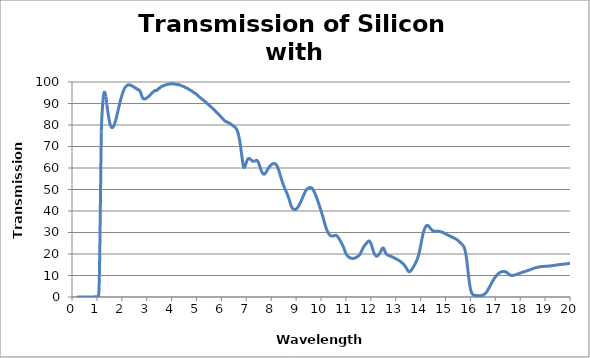
| Category | Series 0 |
|---|---|
| 0.2 | 0.002 |
| 0.201 | 0.002 |
| 0.202 | 0.002 |
| 0.203 | 0.002 |
| 0.204 | 0.002 |
| 0.205 | 0.001 |
| 0.206 | 0 |
| 0.207 | 0.002 |
| 0.208 | 0.002 |
| 0.209 | 0.004 |
| 0.21 | 0.002 |
| 0.211 | 0.001 |
| 0.212 | 0.002 |
| 0.213 | 0.001 |
| 0.214 | 0.002 |
| 0.215 | 0.003 |
| 0.216 | 0.002 |
| 0.217 | 0.002 |
| 0.218 | 0.003 |
| 0.219 | 0.005 |
| 0.22 | 0.002 |
| 0.221 | 0.003 |
| 0.222 | 0.001 |
| 0.223 | 0.003 |
| 0.224 | 0 |
| 0.225 | 0.003 |
| 0.226 | 0.002 |
| 0.227 | 0.003 |
| 0.228 | 0.001 |
| 0.229 | 0.003 |
| 0.23 | 0.002 |
| 0.231 | 0.003 |
| 0.232 | 0 |
| 0.233 | 0.002 |
| 0.234 | 0.001 |
| 0.235 | 0.001 |
| 0.236 | 0 |
| 0.237 | 0.001 |
| 0.238 | 0.005 |
| 0.239 | 0 |
| 0.24 | 0 |
| 0.241 | 0 |
| 0.242 | 0.002 |
| 0.243 | 0.004 |
| 0.244 | 0.002 |
| 0.245 | 0.001 |
| 0.246 | 0.003 |
| 0.247 | 0.003 |
| 0.248 | 0.003 |
| 0.249 | 0.003 |
| 0.25 | 0.001 |
| 0.251 | 0 |
| 0.252 | 0.001 |
| 0.253 | 0.003 |
| 0.254 | 0.002 |
| 0.255 | 0.001 |
| 0.256 | 0.004 |
| 0.257 | 0.001 |
| 0.258 | 0.001 |
| 0.259 | 0.005 |
| 0.26 | 0.002 |
| 0.261 | 0.005 |
| 0.262 | 0.001 |
| 0.263 | 0.001 |
| 0.264 | 0.002 |
| 0.265 | 0.001 |
| 0.266 | 0.004 |
| 0.267 | 0.004 |
| 0.268 | 0.005 |
| 0.269 | 0.001 |
| 0.27 | 0.003 |
| 0.271 | 0.003 |
| 0.272 | 0 |
| 0.273 | 0.002 |
| 0.274 | 0.001 |
| 0.275 | 0.001 |
| 0.276 | 0.001 |
| 0.277 | 0.001 |
| 0.278 | 0 |
| 0.279 | 0.003 |
| 0.28 | 0.003 |
| 0.281 | 0.001 |
| 0.282 | 0.002 |
| 0.283 | 0 |
| 0.284 | 0 |
| 0.285 | 0.007 |
| 0.286 | 0.005 |
| 0.287 | 0.001 |
| 0.288 | 0.004 |
| 0.289 | 0.003 |
| 0.29 | 0 |
| 0.291 | 0.003 |
| 0.292 | 0.001 |
| 0.293 | 0 |
| 0.294 | 0.001 |
| 0.295 | 0 |
| 0.296 | 0.004 |
| 0.297 | 0.002 |
| 0.298 | 0 |
| 0.299 | 0.001 |
| 0.3 | 0.003 |
| 0.301 | 0.001 |
| 0.302 | 0.001 |
| 0.303 | 0.002 |
| 0.304 | 0.002 |
| 0.305 | 0.003 |
| 0.306 | 0.003 |
| 0.307 | 0.001 |
| 0.308 | 0.002 |
| 0.309 | 0.003 |
| 0.31 | 0.001 |
| 0.311 | 0.003 |
| 0.312 | 0.001 |
| 0.313 | 0.001 |
| 0.314 | 0.001 |
| 0.315 | 0.003 |
| 0.316 | 0.003 |
| 0.317 | 0 |
| 0.318 | 0 |
| 0.319 | 0.001 |
| 0.32 | 0.002 |
| 0.321 | 0.004 |
| 0.322 | 0.001 |
| 0.323 | 0 |
| 0.324 | 0.002 |
| 0.325 | 0.002 |
| 0.326 | 0.002 |
| 0.327 | 0.005 |
| 0.328 | 0.002 |
| 0.329 | 0.004 |
| 0.33 | 0.004 |
| 0.331 | 0.002 |
| 0.332 | 0.001 |
| 0.333 | 0.003 |
| 0.334 | 0 |
| 0.335 | 0.001 |
| 0.336 | 0.001 |
| 0.337 | 0.001 |
| 0.338 | 0.001 |
| 0.339 | 0.003 |
| 0.34 | 0 |
| 0.341 | 0.002 |
| 0.342 | 0 |
| 0.343 | 0.002 |
| 0.344 | 0.002 |
| 0.345 | 0.003 |
| 0.346 | 0 |
| 0.347 | 0.006 |
| 0.348 | 0.002 |
| 0.349 | 0.002 |
| 0.35 | 0.002 |
| 0.351 | 0.001 |
| 0.352 | 0.001 |
| 0.353 | 0 |
| 0.354 | 0.001 |
| 0.355 | 0.002 |
| 0.356 | 0 |
| 0.357 | 0.003 |
| 0.358 | 0.002 |
| 0.359 | 0.002 |
| 0.36 | 0.001 |
| 0.361 | 0.002 |
| 0.362 | 0 |
| 0.363 | 0.001 |
| 0.364 | 0 |
| 0.365 | 0.001 |
| 0.366 | 0.001 |
| 0.367 | 0.001 |
| 0.368 | 0.002 |
| 0.369 | 0.001 |
| 0.37 | 0.001 |
| 0.371 | 0.002 |
| 0.372 | 0.002 |
| 0.373 | 0.002 |
| 0.374 | 0 |
| 0.375 | 0 |
| 0.376 | 0.003 |
| 0.377 | 0.004 |
| 0.378 | 0.002 |
| 0.379 | 0.005 |
| 0.38 | 0.004 |
| 0.381 | 0.001 |
| 0.382 | 0 |
| 0.383 | 0 |
| 0.384 | 0.002 |
| 0.385 | 0.001 |
| 0.386 | 0.002 |
| 0.387 | 0.002 |
| 0.388 | 0 |
| 0.389 | 0 |
| 0.39 | 0.001 |
| 0.391 | 0.002 |
| 0.392 | 0.001 |
| 0.393 | 0.002 |
| 0.394 | 0.001 |
| 0.395 | 0.001 |
| 0.396 | 0 |
| 0.397 | 0.002 |
| 0.398 | 0.001 |
| 0.399 | 0 |
| 0.4 | 0.001 |
| 0.401 | 0 |
| 0.402 | 0.002 |
| 0.403 | 0.005 |
| 0.404 | 0.004 |
| 0.405 | 0.002 |
| 0.406 | 0.002 |
| 0.407 | 0 |
| 0.408 | 0.002 |
| 0.409 | 0.001 |
| 0.41 | 0.003 |
| 0.411 | 0 |
| 0.412 | 0.002 |
| 0.413 | 0 |
| 0.414 | 0.002 |
| 0.415 | 0.005 |
| 0.416 | 0.004 |
| 0.417 | 0.001 |
| 0.418 | 0.002 |
| 0.419 | 0.003 |
| 0.42 | 0.001 |
| 0.421 | 0.001 |
| 0.422 | 0.002 |
| 0.423 | 0.003 |
| 0.424 | 0.001 |
| 0.425 | 0.001 |
| 0.426 | 0.003 |
| 0.427 | 0.003 |
| 0.428 | 0.003 |
| 0.429 | 0.001 |
| 0.43 | 0.002 |
| 0.431 | 0.001 |
| 0.432 | 0.001 |
| 0.433 | 0.002 |
| 0.434 | 0.002 |
| 0.435 | 0.001 |
| 0.436 | 0.003 |
| 0.437 | 0.002 |
| 0.438 | 0.002 |
| 0.439 | 0.003 |
| 0.44 | 0.002 |
| 0.441 | 0.001 |
| 0.442 | 0.001 |
| 0.443 | 0 |
| 0.444 | 0.003 |
| 0.445 | 0.002 |
| 0.446 | 0.002 |
| 0.447 | 0 |
| 0.448 | 0.002 |
| 0.449 | 0.001 |
| 0.45 | 0.002 |
| 0.451 | 0 |
| 0.452 | 0 |
| 0.453 | 0.002 |
| 0.454 | 0.001 |
| 0.455 | 0 |
| 0.456 | 0.001 |
| 0.457 | 0.001 |
| 0.458 | 0 |
| 0.459 | 0.001 |
| 0.46 | 0.001 |
| 0.461 | 0 |
| 0.462 | 0.001 |
| 0.463 | 0 |
| 0.464 | 0.001 |
| 0.465 | 0.002 |
| 0.466 | 0 |
| 0.467 | 0.001 |
| 0.468 | 0.003 |
| 0.469 | 0.003 |
| 0.47 | 0.002 |
| 0.471 | 0.001 |
| 0.472 | 0.001 |
| 0.473 | 0.001 |
| 0.474 | 0.002 |
| 0.475 | 0 |
| 0.476 | 0.001 |
| 0.477 | 0 |
| 0.478 | 0.001 |
| 0.479 | 0.002 |
| 0.48 | 0 |
| 0.481 | 0.002 |
| 0.482 | 0.002 |
| 0.483 | 0 |
| 0.484 | 0.001 |
| 0.485 | 0.001 |
| 0.486 | 0.003 |
| 0.487 | 0.001 |
| 0.488 | 0.001 |
| 0.489 | 0.001 |
| 0.49 | 0 |
| 0.491 | 0.001 |
| 0.492 | 0.001 |
| 0.493 | 0.001 |
| 0.494 | 0.001 |
| 0.495 | 0 |
| 0.496 | 0.001 |
| 0.497 | 0.002 |
| 0.498 | 0.003 |
| 0.499 | 0.002 |
| 0.5 | 0.001 |
| 0.501 | 0.001 |
| 0.502 | 0 |
| 0.503 | 0.001 |
| 0.504 | 0 |
| 0.505 | 0.001 |
| 0.506 | 0.004 |
| 0.507 | 0.003 |
| 0.508 | 0.003 |
| 0.509 | 0 |
| 0.51 | 0 |
| 0.511 | 0.003 |
| 0.512 | 0.003 |
| 0.513 | 0.002 |
| 0.514 | 0.003 |
| 0.515 | 0.004 |
| 0.516 | 0.002 |
| 0.517 | 0.002 |
| 0.518 | 0 |
| 0.519 | 0 |
| 0.52 | 0 |
| 0.521 | 0.001 |
| 0.522 | 0.002 |
| 0.523 | 0.003 |
| 0.524 | 0.001 |
| 0.525 | 0.001 |
| 0.526 | 0.001 |
| 0.527 | 0.003 |
| 0.528 | 0.001 |
| 0.529 | 0.001 |
| 0.53 | 0.001 |
| 0.531 | 0.002 |
| 0.532 | 0.002 |
| 0.533 | 0.002 |
| 0.534 | 0.001 |
| 0.535 | 0.002 |
| 0.536 | 0.003 |
| 0.537 | 0 |
| 0.538 | 0.001 |
| 0.539 | 0.001 |
| 0.54 | 0.001 |
| 0.541 | 0.004 |
| 0.542 | 0.001 |
| 0.543 | 0.001 |
| 0.544 | 0.001 |
| 0.545 | 0.001 |
| 0.546 | 0 |
| 0.547 | 0.001 |
| 0.548 | 0.001 |
| 0.549 | 0.003 |
| 0.55 | 0.003 |
| 0.551 | 0.001 |
| 0.552 | 0 |
| 0.553 | 0.004 |
| 0.554 | 0.001 |
| 0.555 | 0 |
| 0.556 | 0.003 |
| 0.557 | 0.002 |
| 0.558 | 0 |
| 0.559 | 0.002 |
| 0.56 | 0.003 |
| 0.561 | 0.001 |
| 0.562 | 0.001 |
| 0.563 | 0.001 |
| 0.564 | 0.002 |
| 0.565 | 0.001 |
| 0.566 | 0.002 |
| 0.567 | 0.003 |
| 0.568 | 0.001 |
| 0.569 | 0.001 |
| 0.57 | 0.001 |
| 0.571 | 0.002 |
| 0.572 | 0.003 |
| 0.573 | 0.003 |
| 0.574 | 0.003 |
| 0.575 | 0 |
| 0.576 | 0.002 |
| 0.577 | 0 |
| 0.578 | 0.005 |
| 0.579 | 0.001 |
| 0.58 | 0.002 |
| 0.581 | 0.002 |
| 0.582 | 0.002 |
| 0.583 | 0 |
| 0.584 | 0.001 |
| 0.585 | 0.002 |
| 0.586 | 0.002 |
| 0.587 | 0.002 |
| 0.588 | 0.002 |
| 0.589 | 0.001 |
| 0.59 | 0.004 |
| 0.591 | 0.001 |
| 0.592 | 0.005 |
| 0.593 | 0.001 |
| 0.594 | 0.002 |
| 0.595 | 0 |
| 0.596 | 0.005 |
| 0.597 | 0.003 |
| 0.598 | 0.004 |
| 0.599 | 0 |
| 0.6 | 0.001 |
| 0.601 | 0 |
| 0.602 | 0.003 |
| 0.603 | 0.001 |
| 0.604 | 0.004 |
| 0.605 | 0.005 |
| 0.606 | 0.001 |
| 0.607 | 0.002 |
| 0.608 | 0.005 |
| 0.609 | 0 |
| 0.61 | 0.002 |
| 0.611 | 0 |
| 0.612 | 0 |
| 0.613 | 0.001 |
| 0.614 | 0.001 |
| 0.615 | 0.001 |
| 0.616 | 0.004 |
| 0.617 | 0.001 |
| 0.618 | 0.001 |
| 0.619 | 0.002 |
| 0.62 | 0.004 |
| 0.621 | 0.001 |
| 0.622 | 0.004 |
| 0.623 | 0 |
| 0.624 | 0.004 |
| 0.625 | 0.004 |
| 0.626 | 0.001 |
| 0.627 | 0.002 |
| 0.628 | 0.004 |
| 0.629 | 0.001 |
| 0.63 | 0.002 |
| 0.631 | 0.002 |
| 0.632 | 0.003 |
| 0.633 | 0 |
| 0.634 | 0.003 |
| 0.635 | 0 |
| 0.636 | 0.001 |
| 0.637 | 0.004 |
| 0.638 | 0.001 |
| 0.639 | 0.003 |
| 0.64 | 0.001 |
| 0.641 | 0.001 |
| 0.642 | 0 |
| 0.643 | 0.008 |
| 0.644 | 0.001 |
| 0.645 | 0.003 |
| 0.646 | 0 |
| 0.647 | 0 |
| 0.648 | 0.001 |
| 0.649 | 0.001 |
| 0.65 | 0.001 |
| 0.651 | 0.002 |
| 0.652 | 0 |
| 0.653 | 0.001 |
| 0.654 | 0.004 |
| 0.655 | 0.001 |
| 0.656 | 0.001 |
| 0.657 | 0 |
| 0.658 | 0.001 |
| 0.659 | 0.003 |
| 0.66 | 0.003 |
| 0.661 | 0.001 |
| 0.662 | 0.001 |
| 0.663 | 0.002 |
| 0.664 | 0.002 |
| 0.665 | 0.001 |
| 0.666 | 0.001 |
| 0.667 | 0 |
| 0.668 | 0.003 |
| 0.669 | 0.003 |
| 0.67 | 0.002 |
| 0.671 | 0.001 |
| 0.672 | 0.001 |
| 0.673 | 0.001 |
| 0.674 | 0.001 |
| 0.675 | 0.001 |
| 0.676 | 0.002 |
| 0.677 | 0.001 |
| 0.678 | 0 |
| 0.679 | 0.003 |
| 0.68 | 0.004 |
| 0.681 | 0.002 |
| 0.682 | 0.001 |
| 0.683 | 0.001 |
| 0.684 | 0.004 |
| 0.685 | 0.002 |
| 0.686 | 0.005 |
| 0.687 | 0.003 |
| 0.688 | 0 |
| 0.689 | 0 |
| 0.69 | 0 |
| 0.691 | 0.001 |
| 0.692 | 0.001 |
| 0.693 | 0.002 |
| 0.694 | 0.002 |
| 0.695 | 0.003 |
| 0.696 | 0.001 |
| 0.697 | 0.001 |
| 0.698 | 0.001 |
| 0.699 | 0.002 |
| 0.7 | 0.001 |
| 0.701 | 0.001 |
| 0.702 | 0.001 |
| 0.703 | 0.002 |
| 0.704 | 0.001 |
| 0.705 | 0 |
| 0.706 | 0.001 |
| 0.707 | 0 |
| 0.708 | 0 |
| 0.709 | 0.002 |
| 0.71 | 0.002 |
| 0.711 | 0.002 |
| 0.712 | 0.004 |
| 0.713 | 0.003 |
| 0.714 | 0.002 |
| 0.715 | 0.002 |
| 0.716 | 0.003 |
| 0.717 | 0 |
| 0.718 | 0 |
| 0.719 | 0.001 |
| 0.72 | 0.003 |
| 0.721 | 0.001 |
| 0.722 | 0.002 |
| 0.723 | 0.001 |
| 0.724 | 0.003 |
| 0.725 | 0.001 |
| 0.726 | 0.001 |
| 0.727 | 0.004 |
| 0.728 | 0.002 |
| 0.729 | 0.001 |
| 0.73 | 0.002 |
| 0.731 | 0.001 |
| 0.732 | 0 |
| 0.733 | 0 |
| 0.734 | 0.002 |
| 0.735 | 0.002 |
| 0.736 | 0.002 |
| 0.737 | 0.001 |
| 0.738 | 0 |
| 0.739 | 0 |
| 0.74 | 0.002 |
| 0.741 | 0 |
| 0.742 | 0 |
| 0.743 | 0.002 |
| 0.744 | 0.005 |
| 0.745 | 0.002 |
| 0.746 | 0.002 |
| 0.747 | 0 |
| 0.748 | 0 |
| 0.749 | 0.003 |
| 0.75 | 0.001 |
| 0.751 | 0.001 |
| 0.752 | 0 |
| 0.753 | 0.002 |
| 0.754 | 0.002 |
| 0.755 | 0.001 |
| 0.756 | 0.002 |
| 0.757 | 0.001 |
| 0.758 | 0.001 |
| 0.759 | 0.004 |
| 0.76 | 0.002 |
| 0.761 | 0.001 |
| 0.762 | 0 |
| 0.763 | 0 |
| 0.764 | 0.001 |
| 0.765 | 0.002 |
| 0.766 | 0.002 |
| 0.767 | 0.003 |
| 0.768 | 0 |
| 0.769 | 0 |
| 0.77 | 0.001 |
| 0.771 | 0.003 |
| 0.772 | 0 |
| 0.773 | 0 |
| 0.774 | 0.001 |
| 0.775 | 0.002 |
| 0.776 | 0.001 |
| 0.777 | 0.001 |
| 0.778 | 0.001 |
| 0.779 | 0.003 |
| 0.78 | 0.001 |
| 0.781 | 0.001 |
| 0.782 | 0.001 |
| 0.783 | 0.001 |
| 0.784 | 0 |
| 0.785 | 0.001 |
| 0.786 | 0.002 |
| 0.787 | 0.002 |
| 0.788 | 0.003 |
| 0.789 | 0.004 |
| 0.79 | 0.002 |
| 0.791 | 0.001 |
| 0.792 | 0.001 |
| 0.793 | 0.002 |
| 0.794 | 0.001 |
| 0.795 | 0.001 |
| 0.796 | 0.004 |
| 0.797 | 0.004 |
| 0.798 | 0.002 |
| 0.799 | 0.002 |
| 0.8 | 0.003 |
| 0.801 | 0.002 |
| 0.802 | 0.002 |
| 0.803 | 0.003 |
| 0.804 | 0.002 |
| 0.805 | 0.002 |
| 0.806 | 0.002 |
| 0.807 | 0 |
| 0.808 | 0.001 |
| 0.809 | 0 |
| 0.81 | 0 |
| 0.811 | 0 |
| 0.812 | 0.002 |
| 0.813 | 0.003 |
| 0.814 | 0.002 |
| 0.815 | 0.001 |
| 0.816 | 0 |
| 0.817 | 0 |
| 0.818 | 0.001 |
| 0.819 | 0.002 |
| 0.82 | 0.003 |
| 0.821 | 0.002 |
| 0.822 | 0.001 |
| 0.823 | 0.003 |
| 0.824 | 0.003 |
| 0.825 | 0 |
| 0.826 | 0.002 |
| 0.827 | 0.003 |
| 0.828 | 0.001 |
| 0.829 | 0.001 |
| 0.83 | 0 |
| 0.831 | 0.003 |
| 0.832 | 0.002 |
| 0.833 | 0.003 |
| 0.834 | 0.003 |
| 0.835 | 0.001 |
| 0.836 | 0.001 |
| 0.837 | 0.001 |
| 0.838 | 0.001 |
| 0.839 | 0 |
| 0.84 | 0.001 |
| 0.841 | 0.001 |
| 0.842 | 0.001 |
| 0.843 | 0.001 |
| 0.844 | 0.002 |
| 0.845 | 0.002 |
| 0.846 | 0.003 |
| 0.847 | 0.001 |
| 0.848 | 0 |
| 0.849 | 0.001 |
| 0.85 | 0.002 |
| 0.851 | 0.001 |
| 0.852 | 0 |
| 0.853 | 0.003 |
| 0.854 | 0.003 |
| 0.855 | 0.004 |
| 0.856 | 0.002 |
| 0.857 | 0.001 |
| 0.858 | 0.001 |
| 0.859 | 0.001 |
| 0.86 | 0.005 |
| 0.861 | 0.006 |
| 0.862 | 0.003 |
| 0.863 | 0.002 |
| 0.864 | 0.005 |
| 0.865 | 0.015 |
| 0.866 | 0.003 |
| 0.867 | 0.001 |
| 0.868 | 0.012 |
| 0.869 | 0 |
| 0.87 | 0.024 |
| 0.871 | 0.014 |
| 0.872 | 0.005 |
| 0.873 | 0.022 |
| 0.874 | 0.022 |
| 0.875 | 0.001 |
| 0.876 | 0.018 |
| 0.877 | 0.037 |
| 0.878 | 0.021 |
| 0.879 | 0.015 |
| 0.88 | 0.023 |
| 0.881 | 0.027 |
| 0.882 | 0.018 |
| 0.883 | 0.012 |
| 0.884 | 0.001 |
| 0.885 | 0.013 |
| 0.886 | 0.023 |
| 0.887 | 0.008 |
| 0.888 | 0.034 |
| 0.889 | 0.022 |
| 0.89 | 0.03 |
| 0.891 | 0.035 |
| 0.892 | 0.031 |
| 0.893 | 0.007 |
| 0.894 | 0.009 |
| 0.895 | 0.002 |
| 0.896 | 0.02 |
| 0.897 | 0.003 |
| 0.898 | 0.054 |
| 0.899 | 0.051 |
| 0.9 | 0.01 |
| 0.901 | 0.017 |
| 0.902 | 0.018 |
| 0.903 | 0.017 |
| 0.904 | 0.045 |
| 0.905 | 0.047 |
| 0.906 | 0.018 |
| 0.907 | 0.044 |
| 0.908 | 0.013 |
| 0.909 | 0.005 |
| 0.91 | 0.022 |
| 0.911 | 0.03 |
| 0.912 | 0.022 |
| 0.913 | 0.022 |
| 0.914 | 0.019 |
| 0.915 | 0.014 |
| 0.916 | 0.035 |
| 0.917 | 0.01 |
| 0.918 | 0.035 |
| 0.919 | 0.033 |
| 0.92 | 0.022 |
| 0.921 | 0.01 |
| 0.922 | 0.056 |
| 0.923 | 0.024 |
| 0.924 | 0.04 |
| 0.925 | 0.028 |
| 0.926 | 0.003 |
| 0.927 | 0.009 |
| 0.928 | 0.036 |
| 0.929 | 0.031 |
| 0.93 | 0.037 |
| 0.931 | 0.034 |
| 0.932 | 0.029 |
| 0.933 | 0.03 |
| 0.934 | 0.025 |
| 0.935 | 0.011 |
| 0.936 | 0.012 |
| 0.937 | 0.039 |
| 0.938 | 0.011 |
| 0.939 | 0.05 |
| 0.94 | 0.022 |
| 0.941 | 0.055 |
| 0.942 | 0.04 |
| 0.943 | 0.021 |
| 0.944 | 0.02 |
| 0.945 | 0.005 |
| 0.946 | 0.067 |
| 0.947 | 0.06 |
| 0.948 | 0.032 |
| 0.949 | 0.04 |
| 0.95 | 0.027 |
| 0.951 | 0.028 |
| 0.952 | 0.022 |
| 0.953 | 0.02 |
| 0.954 | 0.012 |
| 0.955 | 0.034 |
| 0.956 | 0.025 |
| 0.957 | 0.007 |
| 0.958 | 0.031 |
| 0.959 | 0.028 |
| 0.96 | 0.01 |
| 0.961 | 0.035 |
| 0.962 | 0.001 |
| 0.963 | 0.01 |
| 0.964 | 0.013 |
| 0.965 | 0.028 |
| 0.966 | 0.014 |
| 0.967 | 0.027 |
| 0.968 | 0.006 |
| 0.969 | 0.016 |
| 0.97 | 0.014 |
| 0.971 | 0.029 |
| 0.972 | 0.033 |
| 0.973 | 0.056 |
| 0.974 | 0.045 |
| 0.975 | 0.008 |
| 0.976 | 0.013 |
| 0.977 | 0.052 |
| 0.978 | 0.04 |
| 0.979 | 0.044 |
| 0.98 | 0.045 |
| 0.981 | 0.025 |
| 0.982 | 0.029 |
| 0.983 | 0.024 |
| 0.984 | 0.032 |
| 0.985 | 0.029 |
| 0.986 | 0.061 |
| 0.987 | 0.029 |
| 0.988 | 0.036 |
| 0.989 | 0.005 |
| 0.99 | 0.051 |
| 0.991 | 0.031 |
| 0.992 | 0.031 |
| 0.993 | 0.04 |
| 0.994 | 0.03 |
| 0.995 | 0.054 |
| 0.996 | 0.033 |
| 0.997 | 0.029 |
| 0.998 | 0.024 |
| 0.999 | 0.017 |
| 1.0 | 0.053 |
| 1.001 | 0.026 |
| 1.002 | 0.027 |
| 1.003 | 0.035 |
| 1.004 | 0.033 |
| 1.005 | 0.002 |
| 1.006 | 0.045 |
| 1.007 | 0.008 |
| 1.008 | 0.017 |
| 1.009 | 0.014 |
| 1.01 | 0.016 |
| 1.011 | 0.03 |
| 1.012 | 0.039 |
| 1.013 | 0.048 |
| 1.014 | 0.036 |
| 1.015 | 0.042 |
| 1.016 | 0.023 |
| 1.017 | 0.051 |
| 1.018 | 0.038 |
| 1.019 | 0.021 |
| 1.02 | 0.039 |
| 1.021 | 0.032 |
| 1.022 | 0.036 |
| 1.023 | 0.012 |
| 1.024 | 0.059 |
| 1.025 | 0.048 |
| 1.026 | 0.004 |
| 1.027 | 0.026 |
| 1.028 | 0.02 |
| 1.029 | 0.021 |
| 1.03 | 0.04 |
| 1.031 | 0.019 |
| 1.032 | 0.021 |
| 1.033 | 0.022 |
| 1.034 | 0.054 |
| 1.035 | 0.004 |
| 1.036 | 0.052 |
| 1.037 | 0.023 |
| 1.038 | 0.028 |
| 1.039 | 0 |
| 1.04 | 0.004 |
| 1.041 | 0.031 |
| 1.042 | 0.019 |
| 1.043 | 0.033 |
| 1.044 | 0.036 |
| 1.045 | 0.002 |
| 1.046 | 0.033 |
| 1.047 | 0.019 |
| 1.048 | 0.039 |
| 1.049 | 0.015 |
| 1.05 | 0.019 |
| 1.051 | 0.023 |
| 1.052 | 0.004 |
| 1.053 | 0.064 |
| 1.054 | 0.094 |
| 1.055 | 0.108 |
| 1.056 | 0.142 |
| 1.057 | 0.131 |
| 1.058 | 0.105 |
| 1.059 | 0.123 |
| 1.06 | 0.179 |
| 1.061 | 0.241 |
| 1.062 | 0.355 |
| 1.063 | 0.427 |
| 1.064 | 0.514 |
| 1.065 | 0.592 |
| 1.066 | 0.663 |
| 1.067 | 0.729 |
| 1.068 | 0.823 |
| 1.069 | 0.922 |
| 1.07 | 0.967 |
| 1.071 | 1.063 |
| 1.072 | 1.188 |
| 1.073 | 1.375 |
| 1.074 | 1.569 |
| 1.075 | 1.753 |
| 1.076 | 1.94 |
| 1.077 | 2.128 |
| 1.078 | 2.303 |
| 1.079 | 2.479 |
| 1.08 | 2.707 |
| 1.081 | 2.972 |
| 1.082 | 3.233 |
| 1.083 | 3.588 |
| 1.084 | 3.887 |
| 1.085 | 4.192 |
| 1.086 | 4.484 |
| 1.087 | 4.767 |
| 1.088 | 5.107 |
| 1.089 | 5.509 |
| 1.09 | 5.938 |
| 1.091 | 6.347 |
| 1.092 | 6.756 |
| 1.093 | 7.188 |
| 1.094 | 7.616 |
| 1.095 | 8.036 |
| 1.096 | 8.522 |
| 1.097 | 9.024 |
| 1.098 | 9.594 |
| 1.099 | 10.143 |
| 1.1 | 10.691 |
| 1.101 | 11.256 |
| 1.102 | 11.814 |
| 1.103 | 12.396 |
| 1.104 | 12.964 |
| 1.105 | 13.533 |
| 1.106 | 14.141 |
| 1.107 | 14.814 |
| 1.108 | 15.528 |
| 1.109 | 16.215 |
| 1.11 | 16.919 |
| 1.111 | 17.659 |
| 1.112 | 18.413 |
| 1.113 | 19.185 |
| 1.114 | 19.954 |
| 1.115 | 20.75 |
| 1.116 | 21.577 |
| 1.117 | 22.361 |
| 1.118 | 23.158 |
| 1.119 | 23.998 |
| 1.12 | 24.852 |
| 1.121 | 25.694 |
| 1.122 | 26.565 |
| 1.123 | 27.492 |
| 1.124 | 28.371 |
| 1.125 | 29.245 |
| 1.126 | 30.118 |
| 1.127 | 31.023 |
| 1.128 | 31.945 |
| 1.129 | 32.861 |
| 1.13 | 33.777 |
| 1.131 | 34.708 |
| 1.132 | 35.63 |
| 1.133 | 36.557 |
| 1.134 | 37.473 |
| 1.135 | 38.47 |
| 1.136 | 39.487 |
| 1.137 | 40.426 |
| 1.138 | 41.357 |
| 1.139 | 42.286 |
| 1.14 | 43.206 |
| 1.141 | 44.154 |
| 1.142 | 45.086 |
| 1.143 | 46.031 |
| 1.144 | 46.979 |
| 1.145 | 47.907 |
| 1.146 | 48.834 |
| 1.147 | 49.808 |
| 1.148 | 50.757 |
| 1.149 | 51.691 |
| 1.15 | 52.702 |
| 1.151 | 53.727 |
| 1.152 | 54.712 |
| 1.153 | 55.699 |
| 1.154 | 56.656 |
| 1.155 | 57.613 |
| 1.156 | 58.577 |
| 1.157 | 59.521 |
| 1.158 | 60.478 |
| 1.159 | 61.403 |
| 1.16 | 62.29 |
| 1.161 | 63.186 |
| 1.162 | 64.064 |
| 1.163 | 64.946 |
| 1.164 | 65.814 |
| 1.165 | 66.659 |
| 1.166 | 67.454 |
| 1.167 | 68.23 |
| 1.168 | 68.994 |
| 1.169 | 69.764 |
| 1.17 | 70.522 |
| 1.171 | 71.302 |
| 1.172 | 72.117 |
| 1.173 | 72.966 |
| 1.174 | 73.805 |
| 1.175 | 74.669 |
| 1.176 | 75.546 |
| 1.177 | 76.38 |
| 1.178 | 77.115 |
| 1.179 | 77.71 |
| 1.18 | 78.175 |
| 1.181 | 78.587 |
| 1.182 | 78.93 |
| 1.183 | 79.258 |
| 1.184 | 79.581 |
| 1.185 | 79.862 |
| 1.186 | 80.125 |
| 1.187 | 80.39 |
| 1.188 | 80.642 |
| 1.189 | 80.899 |
| 1.19 | 81.178 |
| 1.191 | 81.443 |
| 1.192 | 81.71 |
| 1.193 | 81.972 |
| 1.194 | 82.207 |
| 1.195 | 82.439 |
| 1.196 | 82.675 |
| 1.197 | 82.9 |
| 1.198 | 83.138 |
| 1.199 | 83.375 |
| 1.2 | 83.592 |
| 1.201 | 83.801 |
| 1.202 | 84.025 |
| 1.203 | 84.27 |
| 1.204 | 84.487 |
| 1.205 | 84.685 |
| 1.206 | 84.889 |
| 1.207 | 85.102 |
| 1.208 | 85.309 |
| 1.209 | 85.52 |
| 1.21 | 85.724 |
| 1.211 | 85.917 |
| 1.212 | 86.11 |
| 1.213 | 86.305 |
| 1.214 | 86.456 |
| 1.215 | 86.612 |
| 1.216 | 86.816 |
| 1.217 | 87.027 |
| 1.218 | 87.242 |
| 1.219 | 87.42 |
| 1.22 | 87.582 |
| 1.221 | 87.739 |
| 1.222 | 87.919 |
| 1.223 | 88.125 |
| 1.224 | 88.3 |
| 1.225 | 88.461 |
| 1.226 | 88.628 |
| 1.227 | 88.778 |
| 1.228 | 88.946 |
| 1.229 | 89.112 |
| 1.23 | 89.29 |
| 1.231 | 89.456 |
| 1.232 | 89.601 |
| 1.233 | 89.777 |
| 1.234 | 89.952 |
| 1.235 | 90.107 |
| 1.236 | 90.256 |
| 1.237 | 90.4 |
| 1.238 | 90.541 |
| 1.239 | 90.678 |
| 1.24 | 90.818 |
| 1.241 | 90.966 |
| 1.242 | 91.12 |
| 1.243 | 91.25 |
| 1.244 | 91.386 |
| 1.245 | 91.513 |
| 1.246 | 91.653 |
| 1.247 | 91.787 |
| 1.248 | 91.915 |
| 1.249 | 92.038 |
| 1.25 | 92.166 |
| 1.251 | 92.256 |
| 1.252 | 92.357 |
| 1.253 | 92.465 |
| 1.254 | 92.584 |
| 1.255 | 92.694 |
| 1.256 | 92.781 |
| 1.257 | 92.878 |
| 1.258 | 92.991 |
| 1.259 | 93.086 |
| 1.26 | 93.171 |
| 1.261 | 93.274 |
| 1.262 | 93.386 |
| 1.263 | 93.482 |
| 1.264 | 93.549 |
| 1.265 | 93.64 |
| 1.266 | 93.731 |
| 1.267 | 93.806 |
| 1.268 | 93.891 |
| 1.269 | 93.963 |
| 1.27 | 94.019 |
| 1.271 | 94.1 |
| 1.272 | 94.174 |
| 1.273 | 94.253 |
| 1.274 | 94.333 |
| 1.275 | 94.379 |
| 1.276 | 94.444 |
| 1.277 | 94.509 |
| 1.278 | 94.583 |
| 1.279 | 94.637 |
| 1.28 | 94.68 |
| 1.281 | 94.742 |
| 1.282 | 94.781 |
| 1.283 | 94.809 |
| 1.284 | 94.856 |
| 1.285 | 94.935 |
| 1.286 | 94.97 |
| 1.287 | 94.984 |
| 1.288 | 95.013 |
| 1.289 | 95.04 |
| 1.29 | 95.057 |
| 1.291 | 95.087 |
| 1.292 | 95.126 |
| 1.293 | 95.151 |
| 1.294 | 95.188 |
| 1.295 | 95.183 |
| 1.296 | 95.181 |
| 1.297 | 95.209 |
| 1.298 | 95.256 |
| 1.299 | 95.238 |
| 1.3 | 95.235 |
| 1.301 | 95.235 |
| 1.302 | 95.273 |
| 1.303 | 95.283 |
| 1.304 | 95.293 |
| 1.305 | 95.295 |
| 1.306 | 95.292 |
| 1.307 | 95.296 |
| 1.308 | 95.289 |
| 1.309 | 95.252 |
| 1.31 | 95.242 |
| 1.311 | 95.252 |
| 1.312 | 95.224 |
| 1.313 | 95.218 |
| 1.314 | 95.232 |
| 1.315 | 95.227 |
| 1.316 | 95.194 |
| 1.317 | 95.188 |
| 1.318 | 95.157 |
| 1.319 | 95.116 |
| 1.32 | 95.082 |
| 1.321 | 95.066 |
| 1.322 | 95.031 |
| 1.323 | 94.987 |
| 1.324 | 94.966 |
| 1.325 | 94.929 |
| 1.326 | 94.906 |
| 1.327 | 94.859 |
| 1.328 | 94.85 |
| 1.329 | 94.796 |
| 1.33 | 94.781 |
| 1.331 | 94.741 |
| 1.332 | 94.678 |
| 1.333 | 94.613 |
| 1.334 | 94.588 |
| 1.335 | 94.546 |
| 1.336 | 94.502 |
| 1.337 | 94.436 |
| 1.338 | 94.402 |
| 1.339 | 94.362 |
| 1.34 | 94.319 |
| 1.341 | 94.217 |
| 1.342 | 94.179 |
| 1.343 | 94.121 |
| 1.344 | 94.075 |
| 1.345 | 94.002 |
| 1.346 | 93.929 |
| 1.347 | 93.911 |
| 1.348 | 93.835 |
| 1.349 | 93.765 |
| 1.35 | 93.722 |
| 1.351 | 93.648 |
| 1.352 | 93.54 |
| 1.353 | 93.487 |
| 1.354 | 93.437 |
| 1.355 | 93.372 |
| 1.356 | 93.227 |
| 1.357 | 93.259 |
| 1.358 | 93.175 |
| 1.359 | 93.085 |
| 1.36 | 93.028 |
| 1.361 | 92.906 |
| 1.362 | 92.824 |
| 1.363 | 92.72 |
| 1.364 | 92.689 |
| 1.365 | 92.626 |
| 1.366 | 92.539 |
| 1.367 | 92.46 |
| 1.368 | 92.389 |
| 1.369 | 92.323 |
| 1.37 | 92.228 |
| 1.371 | 92.115 |
| 1.372 | 92.077 |
| 1.373 | 91.996 |
| 1.374 | 91.883 |
| 1.375 | 91.82 |
| 1.376 | 91.684 |
| 1.377 | 91.6 |
| 1.378 | 91.565 |
| 1.379 | 91.514 |
| 1.38 | 91.411 |
| 1.381 | 91.367 |
| 1.382 | 91.22 |
| 1.383 | 91.186 |
| 1.384 | 91.065 |
| 1.385 | 90.997 |
| 1.386 | 90.897 |
| 1.387 | 90.804 |
| 1.388 | 90.696 |
| 1.389 | 90.606 |
| 1.39 | 90.519 |
| 1.391 | 90.438 |
| 1.392 | 90.362 |
| 1.393 | 90.258 |
| 1.394 | 90.173 |
| 1.395 | 90.093 |
| 1.396 | 90 |
| 1.397 | 89.911 |
| 1.398 | 89.806 |
| 1.399 | 89.8 |
| 1.4 | 89.627 |
| 1.401 | 89.529 |
| 1.402 | 89.428 |
| 1.403 | 89.347 |
| 1.404 | 89.241 |
| 1.405 | 89.176 |
| 1.406 | 89.062 |
| 1.407 | 89.001 |
| 1.408 | 88.921 |
| 1.409 | 88.834 |
| 1.41 | 88.762 |
| 1.411 | 88.647 |
| 1.412 | 88.545 |
| 1.413 | 88.452 |
| 1.414 | 88.373 |
| 1.415 | 88.283 |
| 1.416 | 88.193 |
| 1.417 | 88.111 |
| 1.418 | 88.02 |
| 1.419 | 87.954 |
| 1.42 | 87.855 |
| 1.421 | 87.77 |
| 1.422 | 87.691 |
| 1.423 | 87.587 |
| 1.424 | 87.493 |
| 1.425 | 87.399 |
| 1.426 | 87.32 |
| 1.427 | 87.245 |
| 1.428 | 87.136 |
| 1.429 | 87.091 |
| 1.43 | 86.97 |
| 1.431 | 86.89 |
| 1.432 | 86.801 |
| 1.433 | 86.706 |
| 1.434 | 86.636 |
| 1.435 | 86.531 |
| 1.436 | 86.436 |
| 1.437 | 86.366 |
| 1.438 | 86.288 |
| 1.439 | 86.197 |
| 1.44 | 86.124 |
| 1.441 | 86.018 |
| 1.442 | 85.933 |
| 1.443 | 85.839 |
| 1.444 | 85.742 |
| 1.445 | 85.684 |
| 1.446 | 85.59 |
| 1.447 | 85.514 |
| 1.448 | 85.429 |
| 1.449 | 85.337 |
| 1.45 | 85.239 |
| 1.451 | 85.195 |
| 1.452 | 85.119 |
| 1.453 | 85.045 |
| 1.454 | 84.984 |
| 1.455 | 84.895 |
| 1.456 | 84.79 |
| 1.457 | 84.691 |
| 1.458 | 84.607 |
| 1.459 | 84.581 |
| 1.46 | 84.512 |
| 1.461 | 84.447 |
| 1.462 | 84.394 |
| 1.463 | 84.318 |
| 1.464 | 84.226 |
| 1.465 | 84.095 |
| 1.466 | 84.041 |
| 1.467 | 83.989 |
| 1.468 | 83.902 |
| 1.469 | 83.845 |
| 1.47 | 83.769 |
| 1.471 | 83.689 |
| 1.472 | 83.61 |
| 1.473 | 83.545 |
| 1.474 | 83.492 |
| 1.475 | 83.395 |
| 1.476 | 83.328 |
| 1.477 | 83.273 |
| 1.478 | 83.23 |
| 1.479 | 83.168 |
| 1.48 | 83.085 |
| 1.481 | 83.018 |
| 1.482 | 82.963 |
| 1.483 | 82.903 |
| 1.484 | 82.823 |
| 1.485 | 82.759 |
| 1.486 | 82.659 |
| 1.487 | 82.588 |
| 1.488 | 82.527 |
| 1.489 | 82.444 |
| 1.49 | 82.424 |
| 1.491 | 82.36 |
| 1.492 | 82.301 |
| 1.493 | 82.248 |
| 1.494 | 82.183 |
| 1.495 | 82.14 |
| 1.496 | 82.114 |
| 1.497 | 82.052 |
| 1.498 | 81.983 |
| 1.499 | 81.872 |
| 1.5 | 81.798 |
| 1.501 | 81.782 |
| 1.502 | 81.738 |
| 1.503 | 81.694 |
| 1.504 | 81.638 |
| 1.505 | 81.588 |
| 1.506 | 81.531 |
| 1.507 | 81.466 |
| 1.508 | 81.407 |
| 1.509 | 81.378 |
| 1.51 | 81.333 |
| 1.511 | 81.284 |
| 1.512 | 81.224 |
| 1.513 | 81.163 |
| 1.514 | 81.088 |
| 1.515 | 81.054 |
| 1.516 | 81.018 |
| 1.517 | 80.987 |
| 1.518 | 80.946 |
| 1.519 | 80.89 |
| 1.52 | 80.815 |
| 1.521 | 80.746 |
| 1.522 | 80.696 |
| 1.523 | 80.67 |
| 1.524 | 80.645 |
| 1.525 | 80.603 |
| 1.526 | 80.555 |
| 1.527 | 80.529 |
| 1.528 | 80.485 |
| 1.529 | 80.443 |
| 1.53 | 80.395 |
| 1.531 | 80.347 |
| 1.532 | 80.308 |
| 1.533 | 80.252 |
| 1.534 | 80.231 |
| 1.535 | 80.2 |
| 1.536 | 80.165 |
| 1.537 | 80.133 |
| 1.538 | 80.106 |
| 1.539 | 80.08 |
| 1.54 | 80.036 |
| 1.541 | 79.967 |
| 1.542 | 79.897 |
| 1.543 | 79.867 |
| 1.544 | 79.862 |
| 1.545 | 79.846 |
| 1.546 | 79.833 |
| 1.547 | 79.798 |
| 1.548 | 79.773 |
| 1.549 | 79.733 |
| 1.55 | 79.696 |
| 1.551 | 79.665 |
| 1.552 | 79.638 |
| 1.553 | 79.624 |
| 1.554 | 79.605 |
| 1.555 | 79.571 |
| 1.556 | 79.538 |
| 1.557 | 79.526 |
| 1.558 | 79.476 |
| 1.559 | 79.448 |
| 1.56 | 79.451 |
| 1.561 | 79.425 |
| 1.562 | 79.396 |
| 1.563 | 79.368 |
| 1.564 | 79.351 |
| 1.565 | 79.297 |
| 1.566 | 79.261 |
| 1.567 | 79.274 |
| 1.568 | 79.249 |
| 1.569 | 79.238 |
| 1.57 | 79.236 |
| 1.571 | 79.183 |
| 1.572 | 79.132 |
| 1.573 | 79.108 |
| 1.574 | 79.124 |
| 1.575 | 79.127 |
| 1.576 | 79.099 |
| 1.577 | 79.081 |
| 1.578 | 79.061 |
| 1.579 | 79.026 |
| 1.58 | 79.006 |
| 1.581 | 79.009 |
| 1.582 | 79.003 |
| 1.583 | 78.991 |
| 1.584 | 78.979 |
| 1.585 | 78.968 |
| 1.586 | 78.949 |
| 1.587 | 78.955 |
| 1.588 | 78.955 |
| 1.589 | 78.92 |
| 1.59 | 78.896 |
| 1.591 | 78.899 |
| 1.592 | 78.891 |
| 1.593 | 78.86 |
| 1.594 | 78.852 |
| 1.595 | 78.876 |
| 1.596 | 78.877 |
| 1.597 | 78.864 |
| 1.598 | 78.849 |
| 1.599 | 78.848 |
| 1.6 | 78.829 |
| 1.601 | 78.83 |
| 1.602 | 78.833 |
| 1.603 | 78.804 |
| 1.604 | 78.793 |
| 1.605 | 78.815 |
| 1.606 | 78.821 |
| 1.607 | 78.812 |
| 1.608 | 78.814 |
| 1.609 | 78.812 |
| 1.61 | 78.818 |
| 1.611 | 78.817 |
| 1.612 | 78.798 |
| 1.613 | 78.791 |
| 1.614 | 78.785 |
| 1.615 | 78.788 |
| 1.616 | 78.785 |
| 1.617 | 78.796 |
| 1.618 | 78.787 |
| 1.619 | 78.796 |
| 1.62 | 78.791 |
| 1.621 | 78.789 |
| 1.622 | 78.812 |
| 1.623 | 78.833 |
| 1.624 | 78.849 |
| 1.625 | 78.864 |
| 1.626 | 78.865 |
| 1.627 | 78.849 |
| 1.628 | 78.853 |
| 1.629 | 78.843 |
| 1.63 | 78.866 |
| 1.631 | 78.895 |
| 1.632 | 78.907 |
| 1.633 | 78.92 |
| 1.634 | 78.908 |
| 1.635 | 78.902 |
| 1.636 | 78.905 |
| 1.637 | 78.901 |
| 1.638 | 78.905 |
| 1.639 | 78.923 |
| 1.64 | 78.975 |
| 1.641 | 78.994 |
| 1.642 | 78.996 |
| 1.643 | 78.997 |
| 1.644 | 79.004 |
| 1.645 | 79.029 |
| 1.646 | 79.038 |
| 1.647 | 79.054 |
| 1.648 | 79.076 |
| 1.649 | 79.091 |
| 1.65 | 79.108 |
| 1.651 | 79.134 |
| 1.652 | 79.124 |
| 1.653 | 79.125 |
| 1.654 | 79.135 |
| 1.655 | 79.161 |
| 1.656 | 79.182 |
| 1.657 | 79.208 |
| 1.658 | 79.228 |
| 1.659 | 79.234 |
| 1.66 | 79.242 |
| 1.661 | 79.269 |
| 1.662 | 79.293 |
| 1.663 | 79.319 |
| 1.664 | 79.362 |
| 1.665 | 79.358 |
| 1.666 | 79.408 |
| 1.667 | 79.417 |
| 1.668 | 79.421 |
| 1.669 | 79.443 |
| 1.67 | 79.451 |
| 1.671 | 79.475 |
| 1.672 | 79.496 |
| 1.673 | 79.518 |
| 1.674 | 79.546 |
| 1.675 | 79.604 |
| 1.676 | 79.618 |
| 1.677 | 79.632 |
| 1.678 | 79.641 |
| 1.679 | 79.683 |
| 1.68 | 79.66 |
| 1.681 | 79.699 |
| 1.682 | 79.732 |
| 1.683 | 79.761 |
| 1.684 | 79.787 |
| 1.685 | 79.842 |
| 1.686 | 79.856 |
| 1.687 | 79.882 |
| 1.688 | 79.906 |
| 1.689 | 79.934 |
| 1.69 | 79.941 |
| 1.691 | 80.003 |
| 1.692 | 80.027 |
| 1.693 | 80.056 |
| 1.694 | 80.087 |
| 1.695 | 80.101 |
| 1.696 | 80.141 |
| 1.697 | 80.163 |
| 1.698 | 80.2 |
| 1.699 | 80.227 |
| 1.7 | 80.248 |
| 1.701 | 80.266 |
| 1.702 | 80.293 |
| 1.703 | 80.339 |
| 1.704 | 80.365 |
| 1.705 | 80.375 |
| 1.706 | 80.412 |
| 1.707 | 80.458 |
| 1.708 | 80.502 |
| 1.709 | 80.521 |
| 1.71 | 80.573 |
| 1.711 | 80.618 |
| 1.712 | 80.655 |
| 1.713 | 80.689 |
| 1.714 | 80.732 |
| 1.715 | 80.712 |
| 1.716 | 80.754 |
| 1.717 | 80.792 |
| 1.718 | 80.831 |
| 1.719 | 80.888 |
| 1.72 | 80.89 |
| 1.721 | 80.932 |
| 1.722 | 80.992 |
| 1.723 | 81.05 |
| 1.724 | 81.074 |
| 1.725 | 81.11 |
| 1.726 | 81.146 |
| 1.727 | 81.185 |
| 1.728 | 81.215 |
| 1.729 | 81.245 |
| 1.73 | 81.31 |
| 1.731 | 81.291 |
| 1.732 | 81.324 |
| 1.733 | 81.36 |
| 1.734 | 81.411 |
| 1.735 | 81.466 |
| 1.736 | 81.514 |
| 1.737 | 81.549 |
| 1.738 | 81.601 |
| 1.739 | 81.624 |
| 1.74 | 81.649 |
| 1.741 | 81.696 |
| 1.742 | 81.746 |
| 1.743 | 81.788 |
| 1.744 | 81.837 |
| 1.745 | 81.867 |
| 1.746 | 81.913 |
| 1.747 | 81.929 |
| 1.748 | 81.944 |
| 1.749 | 81.997 |
| 1.75 | 82.056 |
| 1.751 | 82.111 |
| 1.752 | 82.147 |
| 1.753 | 82.205 |
| 1.754 | 82.234 |
| 1.755 | 82.289 |
| 1.756 | 82.299 |
| 1.757 | 82.366 |
| 1.758 | 82.399 |
| 1.759 | 82.453 |
| 1.76 | 82.508 |
| 1.761 | 82.547 |
| 1.762 | 82.58 |
| 1.763 | 82.612 |
| 1.764 | 82.661 |
| 1.765 | 82.69 |
| 1.766 | 82.752 |
| 1.767 | 82.791 |
| 1.768 | 82.848 |
| 1.769 | 82.881 |
| 1.77 | 82.921 |
| 1.771 | 82.974 |
| 1.772 | 83.026 |
| 1.773 | 83.066 |
| 1.774 | 83.107 |
| 1.775 | 83.137 |
| 1.776 | 83.166 |
| 1.777 | 83.228 |
| 1.778 | 83.283 |
| 1.779 | 83.348 |
| 1.78 | 83.409 |
| 1.781 | 83.399 |
| 1.782 | 83.44 |
| 1.783 | 83.513 |
| 1.784 | 83.577 |
| 1.785 | 83.613 |
| 1.786 | 83.661 |
| 1.787 | 83.691 |
| 1.788 | 83.738 |
| 1.789 | 83.795 |
| 1.79 | 83.832 |
| 1.791 | 83.865 |
| 1.792 | 83.917 |
| 1.793 | 83.963 |
| 1.794 | 84.036 |
| 1.795 | 84.105 |
| 1.796 | 84.146 |
| 1.797 | 84.134 |
| 1.798 | 84.227 |
| 1.799 | 84.281 |
| 1.8 | 84.324 |
| 1.801 | 84.384 |
| 1.802 | 84.42 |
| 1.803 | 84.441 |
| 1.804 | 84.48 |
| 1.805 | 84.563 |
| 1.806 | 84.612 |
| 1.807 | 84.664 |
| 1.808 | 84.688 |
| 1.809 | 84.743 |
| 1.81 | 84.757 |
| 1.811 | 84.833 |
| 1.812 | 84.882 |
| 1.813 | 84.947 |
| 1.814 | 85.023 |
| 1.815 | 85.049 |
| 1.816 | 85.089 |
| 1.817 | 85.136 |
| 1.818 | 85.171 |
| 1.819 | 85.227 |
| 1.82 | 85.274 |
| 1.821 | 85.313 |
| 1.822 | 85.362 |
| 1.823 | 85.4 |
| 1.824 | 85.462 |
| 1.825 | 85.504 |
| 1.826 | 85.551 |
| 1.827 | 85.605 |
| 1.828 | 85.658 |
| 1.829 | 85.725 |
| 1.83 | 85.776 |
| 1.831 | 85.823 |
| 1.832 | 85.882 |
| 1.833 | 85.923 |
| 1.834 | 85.985 |
| 1.835 | 86.048 |
| 1.836 | 86.072 |
| 1.837 | 86.115 |
| 1.838 | 86.167 |
| 1.839 | 86.202 |
| 1.84 | 86.243 |
| 1.841 | 86.332 |
| 1.842 | 86.417 |
| 1.843 | 86.436 |
| 1.844 | 86.465 |
| 1.845 | 86.518 |
| 1.846 | 86.585 |
| 1.847 | 86.655 |
| 1.848 | 86.718 |
| 1.849 | 86.74 |
| 1.85 | 86.767 |
| 1.851 | 86.835 |
| 1.852 | 86.902 |
| 1.853 | 86.94 |
| 1.854 | 86.99 |
| 1.855 | 86.986 |
| 1.856 | 87.063 |
| 1.857 | 87.13 |
| 1.858 | 87.188 |
| 1.859 | 87.244 |
| 1.86 | 87.272 |
| 1.861 | 87.332 |
| 1.862 | 87.394 |
| 1.863 | 87.431 |
| 1.864 | 87.461 |
| 1.865 | 87.507 |
| 1.866 | 87.557 |
| 1.867 | 87.599 |
| 1.868 | 87.68 |
| 1.869 | 87.761 |
| 1.87 | 87.826 |
| 1.871 | 87.871 |
| 1.872 | 87.926 |
| 1.873 | 87.964 |
| 1.874 | 88.011 |
| 1.875 | 88.042 |
| 1.876 | 88.065 |
| 1.877 | 88.132 |
| 1.878 | 88.19 |
| 1.879 | 88.234 |
| 1.88 | 88.293 |
| 1.881 | 88.357 |
| 1.882 | 88.408 |
| 1.883 | 88.463 |
| 1.884 | 88.502 |
| 1.885 | 88.547 |
| 1.886 | 88.605 |
| 1.887 | 88.639 |
| 1.888 | 88.664 |
| 1.889 | 88.711 |
| 1.89 | 88.768 |
| 1.891 | 88.841 |
| 1.892 | 88.898 |
| 1.893 | 88.935 |
| 1.894 | 88.986 |
| 1.895 | 89.029 |
| 1.896 | 89.051 |
| 1.897 | 89.086 |
| 1.898 | 89.144 |
| 1.899 | 89.213 |
| 1.9 | 89.247 |
| 1.901 | 89.316 |
| 1.902 | 89.38 |
| 1.903 | 89.414 |
| 1.904 | 89.467 |
| 1.905 | 89.513 |
| 1.906 | 89.556 |
| 1.907 | 89.623 |
| 1.908 | 89.682 |
| 1.909 | 89.711 |
| 1.91 | 89.73 |
| 1.911 | 89.77 |
| 1.912 | 89.824 |
| 1.913 | 89.877 |
| 1.914 | 89.954 |
| 1.915 | 90 |
| 1.916 | 90.043 |
| 1.917 | 90.072 |
| 1.918 | 90.104 |
| 1.919 | 90.15 |
| 1.92 | 90.212 |
| 1.921 | 90.273 |
| 1.922 | 90.332 |
| 1.923 | 90.39 |
| 1.924 | 90.435 |
| 1.925 | 90.483 |
| 1.926 | 90.522 |
| 1.927 | 90.57 |
| 1.928 | 90.619 |
| 1.929 | 90.645 |
| 1.93 | 90.68 |
| 1.931 | 90.746 |
| 1.932 | 90.797 |
| 1.933 | 90.845 |
| 1.934 | 90.861 |
| 1.935 | 90.89 |
| 1.936 | 90.973 |
| 1.937 | 91.036 |
| 1.938 | 91.077 |
| 1.939 | 91.102 |
| 1.94 | 91.125 |
| 1.941 | 91.196 |
| 1.942 | 91.225 |
| 1.943 | 91.253 |
| 1.944 | 91.299 |
| 1.945 | 91.335 |
| 1.946 | 91.394 |
| 1.947 | 91.471 |
| 1.948 | 91.525 |
| 1.949 | 91.525 |
| 1.95 | 91.549 |
| 1.951 | 91.606 |
| 1.952 | 91.681 |
| 1.953 | 91.732 |
| 1.954 | 91.745 |
| 1.955 | 91.778 |
| 1.956 | 91.821 |
| 1.957 | 91.84 |
| 1.958 | 91.897 |
| 1.959 | 91.964 |
| 1.96 | 92.001 |
| 1.961 | 92.064 |
| 1.962 | 92.101 |
| 1.963 | 92.128 |
| 1.964 | 92.186 |
| 1.965 | 92.217 |
| 1.966 | 92.252 |
| 1.967 | 92.297 |
| 1.968 | 92.332 |
| 1.969 | 92.401 |
| 1.97 | 92.456 |
| 1.971 | 92.488 |
| 1.972 | 92.518 |
| 1.973 | 92.554 |
| 1.974 | 92.599 |
| 1.975 | 92.637 |
| 1.976 | 92.669 |
| 1.977 | 92.703 |
| 1.978 | 92.744 |
| 1.979 | 92.786 |
| 1.98 | 92.83 |
| 1.981 | 92.865 |
| 1.982 | 92.911 |
| 1.983 | 92.957 |
| 1.984 | 92.998 |
| 1.985 | 93.022 |
| 1.986 | 93.055 |
| 1.987 | 93.092 |
| 1.988 | 93.129 |
| 1.989 | 93.176 |
| 1.99 | 93.225 |
| 1.991 | 93.282 |
| 1.992 | 93.32 |
| 1.993 | 93.355 |
| 1.994 | 93.386 |
| 1.995 | 93.411 |
| 1.996 | 93.423 |
| 1.997 | 93.465 |
| 1.998 | 93.512 |
| 1.999 | 93.561 |
| 2.0 | 93.597 |
| 2.001 | 93.623 |
| 2.002 | 93.661 |
| 2.003 | 93.705 |
| 2.004 | 93.765 |
| 2.005 | 93.827 |
| 2.006 | 93.848 |
| 2.007 | 93.876 |
| 2.008 | 93.902 |
| 2.009 | 93.943 |
| 2.01 | 94.004 |
| 2.011 | 94.027 |
| 2.012 | 94.055 |
| 2.013 | 94.094 |
| 2.014 | 94.134 |
| 2.015 | 94.184 |
| 2.016 | 94.216 |
| 2.017 | 94.25 |
| 2.018 | 94.273 |
| 2.019 | 94.314 |
| 2.02 | 94.371 |
| 2.021 | 94.396 |
| 2.022 | 94.431 |
| 2.023 | 94.467 |
| 2.024 | 94.495 |
| 2.025 | 94.549 |
| 2.026 | 94.555 |
| 2.027 | 94.574 |
| 2.028 | 94.623 |
| 2.029 | 94.678 |
| 2.03 | 94.683 |
| 2.031 | 94.729 |
| 2.032 | 94.746 |
| 2.033 | 94.793 |
| 2.034 | 94.835 |
| 2.035 | 94.858 |
| 2.036 | 94.886 |
| 2.037 | 94.934 |
| 2.038 | 94.98 |
| 2.039 | 95.022 |
| 2.04 | 95.02 |
| 2.041 | 95.043 |
| 2.042 | 95.102 |
| 2.043 | 95.131 |
| 2.044 | 95.15 |
| 2.045 | 95.167 |
| 2.046 | 95.211 |
| 2.047 | 95.234 |
| 2.048 | 95.28 |
| 2.049 | 95.306 |
| 2.05 | 95.335 |
| 2.051 | 95.36 |
| 2.052 | 95.412 |
| 2.053 | 95.441 |
| 2.054 | 95.442 |
| 2.055 | 95.458 |
| 2.056 | 95.519 |
| 2.057 | 95.557 |
| 2.058 | 95.586 |
| 2.059 | 95.618 |
| 2.06 | 95.633 |
| 2.061 | 95.66 |
| 2.062 | 95.677 |
| 2.063 | 95.73 |
| 2.064 | 95.757 |
| 2.065 | 95.769 |
| 2.066 | 95.791 |
| 2.067 | 95.835 |
| 2.068 | 95.868 |
| 2.069 | 95.913 |
| 2.07 | 95.918 |
| 2.071 | 95.955 |
| 2.072 | 95.981 |
| 2.073 | 96.006 |
| 2.074 | 96.027 |
| 2.075 | 96.09 |
| 2.076 | 96.087 |
| 2.077 | 96.092 |
| 2.078 | 96.156 |
| 2.079 | 96.173 |
| 2.08 | 96.232 |
| 2.081 | 96.222 |
| 2.082 | 96.23 |
| 2.083 | 96.282 |
| 2.084 | 96.326 |
| 2.085 | 96.311 |
| 2.086 | 96.362 |
| 2.087 | 96.35 |
| 2.088 | 96.374 |
| 2.089 | 96.4 |
| 2.09 | 96.459 |
| 2.091 | 96.494 |
| 2.092 | 96.466 |
| 2.093 | 96.512 |
| 2.094 | 96.528 |
| 2.095 | 96.6 |
| 2.096 | 96.588 |
| 2.097 | 96.607 |
| 2.098 | 96.626 |
| 2.099 | 96.666 |
| 2.1 | 96.717 |
| 2.101 | 96.706 |
| 2.102 | 96.726 |
| 2.103 | 96.74 |
| 2.104 | 96.76 |
| 2.105 | 96.819 |
| 2.106 | 96.782 |
| 2.107 | 96.832 |
| 2.108 | 96.865 |
| 2.109 | 96.885 |
| 2.11 | 96.941 |
| 2.111 | 96.934 |
| 2.112 | 96.937 |
| 2.113 | 96.967 |
| 2.114 | 96.967 |
| 2.115 | 97.047 |
| 2.116 | 97.034 |
| 2.117 | 97.045 |
| 2.118 | 97.076 |
| 2.119 | 97.085 |
| 2.12 | 97.136 |
| 2.121 | 97.132 |
| 2.122 | 97.132 |
| 2.123 | 97.186 |
| 2.124 | 97.207 |
| 2.125 | 97.252 |
| 2.126 | 97.239 |
| 2.127 | 97.244 |
| 2.128 | 97.283 |
| 2.129 | 97.28 |
| 2.13 | 97.332 |
| 2.131 | 97.314 |
| 2.132 | 97.331 |
| 2.133 | 97.353 |
| 2.134 | 97.409 |
| 2.135 | 97.389 |
| 2.136 | 97.414 |
| 2.137 | 97.448 |
| 2.138 | 97.447 |
| 2.139 | 97.463 |
| 2.14 | 97.527 |
| 2.141 | 97.479 |
| 2.142 | 97.524 |
| 2.143 | 97.545 |
| 2.144 | 97.534 |
| 2.145 | 97.573 |
| 2.146 | 97.574 |
| 2.147 | 97.582 |
| 2.148 | 97.589 |
| 2.149 | 97.63 |
| 2.15 | 97.653 |
| 2.151 | 97.661 |
| 2.152 | 97.661 |
| 2.153 | 97.695 |
| 2.154 | 97.729 |
| 2.155 | 97.716 |
| 2.156 | 97.73 |
| 2.157 | 97.757 |
| 2.158 | 97.762 |
| 2.159 | 97.768 |
| 2.16 | 97.785 |
| 2.161 | 97.832 |
| 2.162 | 97.824 |
| 2.163 | 97.829 |
| 2.164 | 97.869 |
| 2.165 | 97.838 |
| 2.166 | 97.892 |
| 2.167 | 97.9 |
| 2.168 | 97.893 |
| 2.169 | 97.941 |
| 2.17 | 97.938 |
| 2.171 | 97.936 |
| 2.172 | 97.952 |
| 2.173 | 97.948 |
| 2.174 | 97.98 |
| 2.175 | 97.981 |
| 2.176 | 98.003 |
| 2.177 | 97.997 |
| 2.178 | 98.031 |
| 2.179 | 98.065 |
| 2.18 | 98.044 |
| 2.181 | 98.05 |
| 2.182 | 98.067 |
| 2.183 | 98.094 |
| 2.184 | 98.087 |
| 2.185 | 98.108 |
| 2.186 | 98.155 |
| 2.187 | 98.134 |
| 2.188 | 98.137 |
| 2.189 | 98.157 |
| 2.19 | 98.144 |
| 2.191 | 98.18 |
| 2.192 | 98.18 |
| 2.193 | 98.183 |
| 2.194 | 98.215 |
| 2.195 | 98.21 |
| 2.196 | 98.236 |
| 2.197 | 98.225 |
| 2.198 | 98.228 |
| 2.199 | 98.258 |
| 2.2 | 98.27 |
| 2.201 | 98.282 |
| 2.202 | 98.309 |
| 2.203 | 98.301 |
| 2.204 | 98.29 |
| 2.205 | 98.297 |
| 2.206 | 98.324 |
| 2.207 | 98.339 |
| 2.208 | 98.343 |
| 2.209 | 98.358 |
| 2.21 | 98.362 |
| 2.211 | 98.354 |
| 2.212 | 98.373 |
| 2.213 | 98.4 |
| 2.214 | 98.403 |
| 2.215 | 98.399 |
| 2.216 | 98.414 |
| 2.217 | 98.419 |
| 2.218 | 98.417 |
| 2.219 | 98.427 |
| 2.22 | 98.435 |
| 2.221 | 98.423 |
| 2.222 | 98.438 |
| 2.223 | 98.46 |
| 2.224 | 98.453 |
| 2.225 | 98.444 |
| 2.226 | 98.466 |
| 2.227 | 98.469 |
| 2.228 | 98.494 |
| 2.229 | 98.499 |
| 2.23 | 98.501 |
| 2.231 | 98.504 |
| 2.232 | 98.497 |
| 2.233 | 98.501 |
| 2.234 | 98.486 |
| 2.235 | 98.502 |
| 2.236 | 98.52 |
| 2.237 | 98.534 |
| 2.238 | 98.537 |
| 2.239 | 98.528 |
| 2.24 | 98.555 |
| 2.241 | 98.569 |
| 2.242 | 98.581 |
| 2.243 | 98.558 |
| 2.244 | 98.566 |
| 2.245 | 98.57 |
| 2.246 | 98.573 |
| 2.247 | 98.597 |
| 2.248 | 98.601 |
| 2.249 | 98.589 |
| 2.25 | 98.578 |
| 2.251 | 98.585 |
| 2.252 | 98.574 |
| 2.253 | 98.584 |
| 2.254 | 98.596 |
| 2.255 | 98.6 |
| 2.256 | 98.621 |
| 2.257 | 98.648 |
| 2.258 | 98.669 |
| 2.259 | 98.668 |
| 2.26 | 98.645 |
| 2.261 | 98.616 |
| 2.262 | 98.615 |
| 2.263 | 98.631 |
| 2.264 | 98.63 |
| 2.265 | 98.637 |
| 2.266 | 98.641 |
| 2.267 | 98.63 |
| 2.268 | 98.628 |
| 2.269 | 98.639 |
| 2.27 | 98.642 |
| 2.271 | 98.644 |
| 2.272 | 98.63 |
| 2.273 | 98.622 |
| 2.274 | 98.611 |
| 2.275 | 98.609 |
| 2.276 | 98.629 |
| 2.277 | 98.643 |
| 2.278 | 98.641 |
| 2.279 | 98.623 |
| 2.28 | 98.636 |
| 2.281 | 98.659 |
| 2.282 | 98.638 |
| 2.283 | 98.631 |
| 2.284 | 98.643 |
| 2.285 | 98.64 |
| 2.286 | 98.643 |
| 2.287 | 98.64 |
| 2.288 | 98.63 |
| 2.289 | 98.621 |
| 2.29 | 98.633 |
| 2.291 | 98.645 |
| 2.292 | 98.647 |
| 2.293 | 98.638 |
| 2.294 | 98.636 |
| 2.295 | 98.634 |
| 2.296 | 98.644 |
| 2.297 | 98.655 |
| 2.298 | 98.646 |
| 2.299 | 98.646 |
| 2.3 | 98.651 |
| 2.301 | 98.654 |
| 2.302 | 98.651 |
| 2.303 | 98.644 |
| 2.304 | 98.627 |
| 2.305 | 98.615 |
| 2.306 | 98.625 |
| 2.307 | 98.631 |
| 2.308 | 98.629 |
| 2.309 | 98.629 |
| 2.31 | 98.638 |
| 2.311 | 98.637 |
| 2.312 | 98.626 |
| 2.313 | 98.612 |
| 2.314 | 98.598 |
| 2.315 | 98.595 |
| 2.316 | 98.607 |
| 2.317 | 98.629 |
| 2.318 | 98.635 |
| 2.319 | 98.623 |
| 2.32 | 98.609 |
| 2.321 | 98.588 |
| 2.322 | 98.573 |
| 2.323 | 98.583 |
| 2.324 | 98.591 |
| 2.325 | 98.578 |
| 2.326 | 98.572 |
| 2.327 | 98.573 |
| 2.328 | 98.578 |
| 2.329 | 98.577 |
| 2.33 | 98.56 |
| 2.331 | 98.547 |
| 2.332 | 98.546 |
| 2.333 | 98.55 |
| 2.334 | 98.549 |
| 2.335 | 98.549 |
| 2.336 | 98.551 |
| 2.337 | 98.539 |
| 2.338 | 98.535 |
| 2.339 | 98.538 |
| 2.34 | 98.52 |
| 2.341 | 98.527 |
| 2.342 | 98.538 |
| 2.343 | 98.532 |
| 2.344 | 98.515 |
| 2.345 | 98.502 |
| 2.346 | 98.498 |
| 2.347 | 98.51 |
| 2.348 | 98.511 |
| 2.349 | 98.5 |
| 2.35 | 98.498 |
| 2.351 | 98.486 |
| 2.352 | 98.475 |
| 2.353 | 98.467 |
| 2.354 | 98.484 |
| 2.355 | 98.481 |
| 2.356 | 98.465 |
| 2.357 | 98.451 |
| 2.358 | 98.448 |
| 2.359 | 98.473 |
| 2.36 | 98.461 |
| 2.361 | 98.441 |
| 2.362 | 98.452 |
| 2.363 | 98.44 |
| 2.364 | 98.419 |
| 2.365 | 98.418 |
| 2.366 | 98.411 |
| 2.367 | 98.407 |
| 2.368 | 98.431 |
| 2.369 | 98.429 |
| 2.37 | 98.403 |
| 2.371 | 98.394 |
| 2.372 | 98.386 |
| 2.373 | 98.375 |
| 2.374 | 98.377 |
| 2.375 | 98.373 |
| 2.376 | 98.363 |
| 2.377 | 98.375 |
| 2.378 | 98.353 |
| 2.379 | 98.333 |
| 2.38 | 98.343 |
| 2.381 | 98.34 |
| 2.382 | 98.341 |
| 2.383 | 98.312 |
| 2.384 | 98.31 |
| 2.385 | 98.332 |
| 2.386 | 98.333 |
| 2.387 | 98.325 |
| 2.388 | 98.312 |
| 2.389 | 98.302 |
| 2.39 | 98.297 |
| 2.391 | 98.297 |
| 2.392 | 98.276 |
| 2.393 | 98.286 |
| 2.394 | 98.278 |
| 2.395 | 98.259 |
| 2.396 | 98.235 |
| 2.397 | 98.232 |
| 2.398 | 98.233 |
| 2.399 | 98.244 |
| 2.4 | 98.246 |
| 2.401 | 98.244 |
| 2.402 | 98.23 |
| 2.403 | 98.22 |
| 2.404 | 98.208 |
| 2.405 | 98.185 |
| 2.406 | 98.167 |
| 2.407 | 98.164 |
| 2.408 | 98.178 |
| 2.409 | 98.187 |
| 2.41 | 98.18 |
| 2.411 | 98.171 |
| 2.412 | 98.155 |
| 2.413 | 98.166 |
| 2.414 | 98.181 |
| 2.415 | 98.165 |
| 2.416 | 98.164 |
| 2.417 | 98.18 |
| 2.418 | 98.173 |
| 2.419 | 98.166 |
| 2.42 | 98.129 |
| 2.421 | 98.116 |
| 2.422 | 98.104 |
| 2.423 | 98.096 |
| 2.424 | 98.063 |
| 2.425 | 98.096 |
| 2.426 | 98.073 |
| 2.427 | 98.056 |
| 2.428 | 98.059 |
| 2.429 | 98.054 |
| 2.43 | 98.055 |
| 2.431 | 98.036 |
| 2.432 | 98.026 |
| 2.433 | 98.003 |
| 2.434 | 98.006 |
| 2.435 | 98.01 |
| 2.436 | 97.983 |
| 2.437 | 97.991 |
| 2.438 | 98.004 |
| 2.439 | 97.981 |
| 2.44 | 97.983 |
| 2.441 | 98.005 |
| 2.442 | 98.002 |
| 2.443 | 97.988 |
| 2.444 | 97.97 |
| 2.445 | 97.965 |
| 2.446 | 97.956 |
| 2.447 | 97.981 |
| 2.448 | 97.97 |
| 2.449 | 97.942 |
| 2.45 | 97.911 |
| 2.451 | 97.902 |
| 2.452 | 97.921 |
| 2.453 | 97.919 |
| 2.454 | 97.902 |
| 2.455 | 97.894 |
| 2.456 | 97.895 |
| 2.457 | 97.868 |
| 2.458 | 97.872 |
| 2.459 | 97.851 |
| 2.46 | 97.863 |
| 2.461 | 97.871 |
| 2.462 | 97.836 |
| 2.463 | 97.827 |
| 2.464 | 97.865 |
| 2.465 | 97.841 |
| 2.466 | 97.834 |
| 2.467 | 97.807 |
| 2.468 | 97.789 |
| 2.469 | 97.787 |
| 2.47 | 97.801 |
| 2.471 | 97.778 |
| 2.472 | 97.764 |
| 2.473 | 97.749 |
| 2.474 | 97.765 |
| 2.475 | 97.751 |
| 2.476 | 97.734 |
| 2.477 | 97.729 |
| 2.478 | 97.722 |
| 2.479 | 97.722 |
| 2.48 | 97.731 |
| 2.481 | 97.712 |
| 2.482 | 97.705 |
| 2.483 | 97.684 |
| 2.484 | 97.66 |
| 2.485 | 97.671 |
| 2.486 | 97.657 |
| 2.487 | 97.65 |
| 2.488 | 97.638 |
| 2.489 | 97.648 |
| 2.49 | 97.654 |
| 2.491 | 97.631 |
| 2.492 | 97.634 |
| 2.493 | 97.59 |
| 2.494 | 97.589 |
| 2.495 | 97.579 |
| 2.496 | 97.604 |
| 2.497 | 97.612 |
| 2.498 | 97.6 |
| 2.499 | 97.591 |
| 2.5 | 97.557 |
| 2.5016700000000003 | 97.603 |
| 2.50939 | 97.531 |
| 2.51711 | 97.478 |
| 2.52484 | 97.415 |
| 2.53256 | 97.367 |
| 2.54028 | 97.284 |
| 2.548 | 97.222 |
| 2.55572 | 97.167 |
| 2.56344 | 97.163 |
| 2.57116 | 97.062 |
| 2.5788800000000003 | 97.028 |
| 2.5866100000000003 | 96.988 |
| 2.59433 | 96.824 |
| 2.60205 | 96.776 |
| 2.60977 | 96.807 |
| 2.6174899999999997 | 96.737 |
| 2.62521 | 96.624 |
| 2.63293 | 96.664 |
| 2.64065 | 96.497 |
| 2.64838 | 96.479 |
| 2.6561 | 96.446 |
| 2.6638200000000003 | 96.376 |
| 2.67154 | 96.442 |
| 2.67926 | 96.384 |
| 2.68698 | 96.25 |
| 2.6946999999999997 | 96.184 |
| 2.70242 | 96.102 |
| 2.71015 | 96.033 |
| 2.71787 | 95.885 |
| 2.72559 | 95.882 |
| 2.73331 | 95.631 |
| 2.7410300000000003 | 95.596 |
| 2.74875 | 95.307 |
| 2.7564699999999998 | 95.16 |
| 2.76419 | 94.815 |
| 2.7719099999999997 | 94.541 |
| 2.7796399999999997 | 94.272 |
| 2.78736 | 94.002 |
| 2.79508 | 93.703 |
| 2.8028000000000004 | 93.454 |
| 2.81052 | 93.224 |
| 2.81824 | 93.022 |
| 2.8259600000000002 | 92.814 |
| 2.8336799999999998 | 92.636 |
| 2.8414099999999998 | 92.47 |
| 2.84913 | 92.344 |
| 2.85685 | 92.284 |
| 2.86457 | 92.233 |
| 2.87229 | 92.209 |
| 2.8800100000000004 | 92.179 |
| 2.88773 | 92.15 |
| 2.89545 | 92.129 |
| 2.90318 | 92.119 |
| 2.9109000000000003 | 92.104 |
| 2.9186199999999998 | 92.086 |
| 2.92634 | 92.098 |
| 2.93406 | 92.111 |
| 2.94178 | 92.155 |
| 2.9495 | 92.205 |
| 2.95722 | 92.245 |
| 2.96495 | 92.296 |
| 2.97267 | 92.349 |
| 2.98039 | 92.403 |
| 2.9881100000000003 | 92.465 |
| 2.9958299999999998 | 92.546 |
| 3.00355 | 92.629 |
| 3.01127 | 92.709 |
| 3.0189899999999996 | 92.786 |
| 3.02671 | 92.854 |
| 3.03444 | 92.916 |
| 3.04216 | 92.973 |
| 3.04988 | 93.03 |
| 3.0576 | 93.104 |
| 3.0653200000000003 | 93.159 |
| 3.0730399999999998 | 93.238 |
| 3.08076 | 93.313 |
| 3.08848 | 93.378 |
| 3.09621 | 93.443 |
| 3.1039299999999996 | 93.515 |
| 3.11165 | 93.611 |
| 3.11937 | 93.705 |
| 3.12709 | 93.812 |
| 3.13481 | 93.915 |
| 3.1425300000000003 | 94.021 |
| 3.15025 | 94.112 |
| 3.1579800000000002 | 94.205 |
| 3.1656999999999997 | 94.3 |
| 3.17342 | 94.397 |
| 3.18114 | 94.485 |
| 3.18886 | 94.584 |
| 3.19658 | 94.678 |
| 3.2043000000000004 | 94.784 |
| 3.21202 | 94.867 |
| 3.21975 | 94.943 |
| 3.22747 | 95.032 |
| 3.2351900000000002 | 95.109 |
| 3.2429099999999997 | 95.191 |
| 3.25063 | 95.26 |
| 3.25835 | 95.336 |
| 3.26607 | 95.408 |
| 3.27379 | 95.497 |
| 3.2815100000000004 | 95.58 |
| 3.28924 | 95.66 |
| 3.29696 | 95.737 |
| 3.30468 | 95.798 |
| 3.3124000000000002 | 95.864 |
| 3.3201199999999997 | 95.938 |
| 3.32784 | 95.973 |
| 3.33556 | 96.027 |
| 3.34328 | 96.046 |
| 3.35101 | 96.063 |
| 3.35873 | 96.068 |
| 3.36645 | 96.004 |
| 3.37417 | 95.933 |
| 3.38189 | 95.981 |
| 3.3896100000000002 | 96.126 |
| 3.3973299999999997 | 96.187 |
| 3.40505 | 96.122 |
| 3.41278 | 96.099 |
| 3.4205 | 96.147 |
| 3.4282199999999996 | 96.338 |
| 3.43594 | 96.473 |
| 3.44366 | 96.571 |
| 3.45138 | 96.687 |
| 3.4591 | 96.784 |
| 3.4668200000000002 | 96.839 |
| 3.4745500000000002 | 96.868 |
| 3.48227 | 96.907 |
| 3.4899899999999997 | 96.924 |
| 3.49771 | 96.944 |
| 3.50543 | 97 |
| 3.51315 | 97.155 |
| 3.52087 | 97.294 |
| 3.5285900000000003 | 97.38 |
| 3.53631 | 97.453 |
| 3.54404 | 97.532 |
| 3.5517600000000003 | 97.604 |
| 3.55948 | 97.661 |
| 3.5671999999999997 | 97.705 |
| 3.57492 | 97.755 |
| 3.58264 | 97.785 |
| 3.59036 | 97.808 |
| 3.59808 | 97.846 |
| 3.60581 | 97.892 |
| 3.6135300000000004 | 97.932 |
| 3.62125 | 97.976 |
| 3.62897 | 98.031 |
| 3.63669 | 98.097 |
| 3.6444099999999997 | 98.137 |
| 3.65213 | 98.181 |
| 3.65985 | 98.224 |
| 3.66758 | 98.26 |
| 3.6753 | 98.286 |
| 3.68302 | 98.31 |
| 3.69074 | 98.338 |
| 3.69846 | 98.368 |
| 3.70618 | 98.401 |
| 3.7139 | 98.434 |
| 3.7216199999999997 | 98.473 |
| 3.7293499999999997 | 98.534 |
| 3.73707 | 98.57 |
| 3.74479 | 98.6 |
| 3.75251 | 98.623 |
| 3.76023 | 98.648 |
| 3.76795 | 98.669 |
| 3.77567 | 98.692 |
| 3.78339 | 98.72 |
| 3.79111 | 98.74 |
| 3.79884 | 98.755 |
| 3.80656 | 98.778 |
| 3.81428 | 98.8 |
| 3.822 | 98.831 |
| 3.82972 | 98.859 |
| 3.83744 | 98.88 |
| 3.84516 | 98.901 |
| 3.8528800000000003 | 98.921 |
| 3.8606100000000003 | 98.944 |
| 3.86833 | 98.96 |
| 3.87605 | 98.967 |
| 3.88377 | 98.979 |
| 3.8914899999999997 | 98.989 |
| 3.89921 | 98.996 |
| 3.90693 | 99.008 |
| 3.91465 | 99.032 |
| 3.92238 | 99.049 |
| 3.9301 | 99.065 |
| 3.9378200000000003 | 99.079 |
| 3.94554 | 99.101 |
| 3.95326 | 99.113 |
| 3.96098 | 99.124 |
| 3.9686999999999997 | 99.136 |
| 3.97642 | 99.136 |
| 3.98415 | 99.134 |
| 3.99187 | 99.13 |
| 3.99959 | 99.124 |
| 4.00731 | 99.126 |
| 4.01503 | 99.122 |
| 4.02275 | 99.127 |
| 4.03047 | 99.14 |
| 4.03819 | 99.144 |
| 4.04591 | 99.154 |
| 4.05364 | 99.159 |
| 4.0613600000000005 | 99.165 |
| 4.06908 | 99.161 |
| 4.0768 | 99.15 |
| 4.08452 | 99.135 |
| 4.092239999999999 | 99.118 |
| 4.09996 | 99.099 |
| 4.10768 | 99.074 |
| 4.11541 | 99.048 |
| 4.12313 | 99.026 |
| 4.130850000000001 | 99.009 |
| 4.13857 | 98.998 |
| 4.14629 | 98.992 |
| 4.15401 | 98.977 |
| 4.1617299999999995 | 98.982 |
| 4.169449999999999 | 98.978 |
| 4.17718 | 98.97 |
| 4.1849 | 98.957 |
| 4.19262 | 98.933 |
| 4.20034 | 98.91 |
| 4.208060000000001 | 98.877 |
| 4.21578 | 98.85 |
| 4.2235 | 98.804 |
| 4.23122 | 98.733 |
| 4.23895 | 98.785 |
| 4.24667 | 98.852 |
| 4.25439 | 98.834 |
| 4.26211 | 98.714 |
| 4.26983 | 98.708 |
| 4.27755 | 98.718 |
| 4.285270000000001 | 98.702 |
| 4.29299 | 98.698 |
| 4.3007100000000005 | 98.679 |
| 4.308439999999999 | 98.672 |
| 4.31616 | 98.652 |
| 4.32388 | 98.622 |
| 4.331600000000001 | 98.597 |
| 4.33932 | 98.552 |
| 4.34704 | 98.506 |
| 4.354760000000001 | 98.468 |
| 4.36248 | 98.422 |
| 4.37021 | 98.372 |
| 4.37793 | 98.325 |
| 4.38565 | 98.28 |
| 4.39337 | 98.232 |
| 4.40109 | 98.195 |
| 4.408810000000001 | 98.171 |
| 4.41653 | 98.14 |
| 4.42425 | 98.11 |
| 4.431979999999999 | 98.088 |
| 4.4397 | 98.065 |
| 4.44742 | 98.036 |
| 4.45514 | 98.007 |
| 4.46286 | 97.978 |
| 4.47058 | 97.953 |
| 4.4783 | 97.923 |
| 4.486020000000001 | 97.881 |
| 4.49375 | 97.834 |
| 4.50147 | 97.785 |
| 4.509189999999999 | 97.737 |
| 4.51691 | 97.69 |
| 4.52463 | 97.634 |
| 4.53235 | 97.581 |
| 4.54007 | 97.533 |
| 4.54779 | 97.478 |
| 4.55551 | 97.428 |
| 4.5632399999999995 | 97.383 |
| 4.57096 | 97.345 |
| 4.57868 | 97.307 |
| 4.586399999999999 | 97.268 |
| 4.59412 | 97.234 |
| 4.60184 | 97.203 |
| 4.60956 | 97.172 |
| 4.61728 | 97.133 |
| 4.6250100000000005 | 97.092 |
| 4.63273 | 97.052 |
| 4.6404499999999995 | 97.008 |
| 4.64817 | 96.958 |
| 4.65589 | 96.902 |
| 4.663609999999999 | 96.841 |
| 4.67133 | 96.776 |
| 4.67905 | 96.711 |
| 4.68678 | 96.65 |
| 4.6945 | 96.586 |
| 4.7022200000000005 | 96.526 |
| 4.70994 | 96.47 |
| 4.7176599999999995 | 96.415 |
| 4.72538 | 96.356 |
| 4.7331 | 96.3 |
| 4.740819999999999 | 96.255 |
| 4.74855 | 96.212 |
| 4.756270000000001 | 96.165 |
| 4.76399 | 96.122 |
| 4.77171 | 96.08 |
| 4.7794300000000005 | 96.037 |
| 4.78715 | 95.989 |
| 4.7948699999999995 | 95.933 |
| 4.80259 | 95.877 |
| 4.81031 | 95.82 |
| 4.81804 | 95.759 |
| 4.82576 | 95.698 |
| 4.83348 | 95.636 |
| 4.8412 | 95.57 |
| 4.84892 | 95.496 |
| 4.8566400000000005 | 95.421 |
| 4.86436 | 95.346 |
| 4.8720799999999995 | 95.277 |
| 4.87981 | 95.206 |
| 4.88753 | 95.138 |
| 4.89525 | 95.08 |
| 4.90297 | 95.017 |
| 4.91069 | 94.951 |
| 4.91841 | 94.889 |
| 4.92613 | 94.833 |
| 4.9338500000000005 | 94.78 |
| 4.94158 | 94.722 |
| 4.9493 | 94.667 |
| 4.957020000000001 | 94.619 |
| 4.96474 | 94.564 |
| 4.97246 | 94.502 |
| 4.980180000000001 | 94.438 |
| 4.9879 | 94.37 |
| 4.99562 | 94.299 |
| 5.00335 | 94.226 |
| 5.01107 | 94.153 |
| 5.01879 | 94.076 |
| 5.02651 | 93.992 |
| 5.03423 | 93.906 |
| 5.04195 | 93.824 |
| 5.04967 | 93.743 |
| 5.057390000000001 | 93.661 |
| 5.06511 | 93.577 |
| 5.07284 | 93.497 |
| 5.08056 | 93.413 |
| 5.08828 | 93.33 |
| 5.096 | 93.248 |
| 5.10372 | 93.168 |
| 5.11144 | 93.092 |
| 5.11916 | 93.018 |
| 5.12688 | 92.945 |
| 5.1346099999999995 | 92.872 |
| 5.14233 | 92.803 |
| 5.15005 | 92.737 |
| 5.15777 | 92.659 |
| 5.16549 | 92.578 |
| 5.17321 | 92.502 |
| 5.18093 | 92.427 |
| 5.18865 | 92.352 |
| 5.19638 | 92.279 |
| 5.2041 | 92.205 |
| 5.2118199999999995 | 92.129 |
| 5.21954 | 92.054 |
| 5.22726 | 91.975 |
| 5.234979999999999 | 91.901 |
| 5.2427 | 91.828 |
| 5.25042 | 91.751 |
| 5.25814 | 91.672 |
| 5.26587 | 91.596 |
| 5.27359 | 91.529 |
| 5.28131 | 91.462 |
| 5.2890299999999995 | 91.392 |
| 5.29675 | 91.322 |
| 5.30447 | 91.249 |
| 5.312189999999999 | 91.175 |
| 5.31991 | 91.102 |
| 5.327640000000001 | 91.028 |
| 5.33536 | 90.951 |
| 5.34308 | 90.881 |
| 5.3508000000000004 | 90.824 |
| 5.35852 | 90.753 |
| 5.3662399999999995 | 90.664 |
| 5.37396 | 90.579 |
| 5.38168 | 90.503 |
| 5.38941 | 90.428 |
| 5.39713 | 90.351 |
| 5.404850000000001 | 90.273 |
| 5.41257 | 90.195 |
| 5.42029 | 90.128 |
| 5.4280100000000004 | 90.06 |
| 5.4357299999999995 | 89.973 |
| 5.4434499999999995 | 89.884 |
| 5.45118 | 89.801 |
| 5.4589 | 89.726 |
| 5.46662 | 89.663 |
| 5.47434 | 89.587 |
| 5.482060000000001 | 89.502 |
| 5.48978 | 89.416 |
| 5.4975 | 89.328 |
| 5.5052200000000004 | 89.242 |
| 5.5129399999999995 | 89.163 |
| 5.52067 | 89.087 |
| 5.52839 | 89.007 |
| 5.53611 | 88.918 |
| 5.54383 | 88.83 |
| 5.55155 | 88.754 |
| 5.559270000000001 | 88.678 |
| 5.56699 | 88.592 |
| 5.57471 | 88.507 |
| 5.582439999999999 | 88.43 |
| 5.59016 | 88.34 |
| 5.59788 | 88.247 |
| 5.605600000000001 | 88.161 |
| 5.61332 | 88.081 |
| 5.62104 | 87.998 |
| 5.628760000000001 | 87.913 |
| 5.63648 | 87.839 |
| 5.64421 | 87.776 |
| 5.65193 | 87.697 |
| 5.65965 | 87.6 |
| 5.66737 | 87.509 |
| 5.67509 | 87.434 |
| 5.682810000000001 | 87.362 |
| 5.69053 | 87.284 |
| 5.69825 | 87.199 |
| 5.705979999999999 | 87.116 |
| 5.7137 | 87.042 |
| 5.72142 | 86.958 |
| 5.72914 | 86.854 |
| 5.73686 | 86.747 |
| 5.74458 | 86.647 |
| 5.7523 | 86.546 |
| 5.760020000000001 | 86.441 |
| 5.76774 | 86.346 |
| 5.77547 | 86.251 |
| 5.783189999999999 | 86.144 |
| 5.79091 | 86.04 |
| 5.79863 | 85.944 |
| 5.80635 | 85.854 |
| 5.81407 | 85.773 |
| 5.82179 | 85.708 |
| 5.82951 | 85.637 |
| 5.8372399999999995 | 85.54 |
| 5.84496 | 85.435 |
| 5.85268 | 85.343 |
| 5.860399999999999 | 85.268 |
| 5.86812 | 85.192 |
| 5.87584 | 85.111 |
| 5.88356 | 85.034 |
| 5.89128 | 84.953 |
| 5.8990100000000005 | 84.853 |
| 5.90673 | 84.741 |
| 5.9144499999999995 | 84.636 |
| 5.92217 | 84.544 |
| 5.92989 | 84.463 |
| 5.937609999999999 | 84.386 |
| 5.94533 | 84.291 |
| 5.95305 | 84.177 |
| 5.96078 | 84.067 |
| 5.9685 | 83.974 |
| 5.9762200000000005 | 83.888 |
| 5.98394 | 83.802 |
| 5.9916599999999995 | 83.711 |
| 5.99938 | 83.611 |
| 6.0071 | 83.509 |
| 6.014819999999999 | 83.413 |
| 6.02254 | 83.314 |
| 6.030270000000001 | 83.21 |
| 6.03799 | 83.116 |
| 6.04571 | 83.042 |
| 6.0534300000000005 | 82.967 |
| 6.06115 | 82.869 |
| 6.0688699999999995 | 82.759 |
| 6.07659 | 82.643 |
| 6.08431 | 82.521 |
| 6.09204 | 82.405 |
| 6.09976 | 82.308 |
| 6.10748 | 82.23 |
| 6.1152 | 82.152 |
| 6.12292 | 82.058 |
| 6.1306400000000005 | 81.964 |
| 6.13836 | 81.886 |
| 6.1460799999999995 | 81.824 |
| 6.15381 | 81.771 |
| 6.16153 | 81.72 |
| 6.16925 | 81.669 |
| 6.17697 | 81.622 |
| 6.18469 | 81.588 |
| 6.19241 | 81.556 |
| 6.20013 | 81.514 |
| 6.2078500000000005 | 81.474 |
| 6.21558 | 81.444 |
| 6.2233 | 81.417 |
| 6.23102 | 81.386 |
| 6.23874 | 81.352 |
| 6.24646 | 81.316 |
| 6.25418 | 81.277 |
| 6.2619 | 81.237 |
| 6.26962 | 81.192 |
| 6.277340000000001 | 81.143 |
| 6.285069999999999 | 81.093 |
| 6.29279 | 81.045 |
| 6.30051 | 80.997 |
| 6.30823 | 80.943 |
| 6.31595 | 80.885 |
| 6.32367 | 80.826 |
| 6.331390000000001 | 80.768 |
| 6.33911 | 80.717 |
| 6.34684 | 80.669 |
| 6.35456 | 80.609 |
| 6.36228 | 80.541 |
| 6.37 | 80.475 |
| 6.37772 | 80.41 |
| 6.38544 | 80.339 |
| 6.39316 | 80.266 |
| 6.40088 | 80.196 |
| 6.4086099999999995 | 80.14 |
| 6.41633 | 80.097 |
| 6.42405 | 80.043 |
| 6.43177 | 79.97 |
| 6.43949 | 79.89 |
| 6.44721 | 79.815 |
| 6.45493 | 79.744 |
| 6.46265 | 79.677 |
| 6.4703800000000005 | 79.617 |
| 6.4781 | 79.566 |
| 6.4858199999999995 | 79.522 |
| 6.49354 | 79.473 |
| 6.50126 | 79.404 |
| 6.508979999999999 | 79.319 |
| 6.5167 | 79.237 |
| 6.52442 | 79.158 |
| 6.53214 | 79.077 |
| 6.53987 | 78.992 |
| 6.5475900000000005 | 78.908 |
| 6.55531 | 78.828 |
| 6.5630299999999995 | 78.746 |
| 6.57075 | 78.65 |
| 6.57847 | 78.536 |
| 6.586189999999999 | 78.409 |
| 6.59391 | 78.273 |
| 6.601640000000001 | 78.13 |
| 6.60936 | 77.984 |
| 6.61708 | 77.838 |
| 6.6248000000000005 | 77.68 |
| 6.63252 | 77.488 |
| 6.6402399999999995 | 77.238 |
| 6.64796 | 76.968 |
| 6.65568 | 76.722 |
| 6.66341 | 76.47 |
| 6.67113 | 76.177 |
| 6.678850000000001 | 75.833 |
| 6.68657 | 75.46 |
| 6.69429 | 75.089 |
| 6.7020100000000005 | 74.715 |
| 6.7097299999999995 | 74.301 |
| 6.7174499999999995 | 73.82 |
| 6.72518 | 73.304 |
| 6.7329 | 72.796 |
| 6.74062 | 72.279 |
| 6.74834 | 71.739 |
| 6.756060000000001 | 71.179 |
| 6.76378 | 70.605 |
| 6.7715 | 70.01 |
| 6.7792200000000005 | 69.367 |
| 6.7869399999999995 | 68.631 |
| 6.79467 | 67.847 |
| 6.80239 | 67.134 |
| 6.81011 | 66.485 |
| 6.81783 | 65.841 |
| 6.82555 | 65.162 |
| 6.833270000000001 | 64.469 |
| 6.84099 | 63.844 |
| 6.84871 | 63.293 |
| 6.856439999999999 | 62.696 |
| 6.86416 | 62.053 |
| 6.87188 | 61.466 |
| 6.8796 | 61.01 |
| 6.88732 | 60.688 |
| 6.89504 | 60.452 |
| 6.90276 | 60.293 |
| 6.91048 | 60.206 |
| 6.91821 | 60.188 |
| 6.92593 | 60.231 |
| 6.933649999999999 | 60.326 |
| 6.94137 | 60.467 |
| 6.94909 | 60.668 |
| 6.956810000000001 | 60.933 |
| 6.96453 | 61.236 |
| 6.97225 | 61.543 |
| 6.979979999999999 | 61.826 |
| 6.9877 | 62.104 |
| 6.99542 | 62.388 |
| 7.00314 | 62.661 |
| 7.01086 | 62.915 |
| 7.01858 | 63.151 |
| 7.0263 | 63.373 |
| 7.034020000000001 | 63.578 |
| 7.04174 | 63.777 |
| 7.04947 | 63.962 |
| 7.057189999999999 | 64.12 |
| 7.06491 | 64.237 |
| 7.07263 | 64.31 |
| 7.08035 | 64.366 |
| 7.08807 | 64.406 |
| 7.09579 | 64.429 |
| 7.10351 | 64.436 |
| 7.11124 | 64.423 |
| 7.11896 | 64.398 |
| 7.12668 | 64.363 |
| 7.134399999999999 | 64.321 |
| 7.14212 | 64.271 |
| 7.14984 | 64.213 |
| 7.15756 | 64.145 |
| 7.16528 | 64.067 |
| 7.1730100000000006 | 63.979 |
| 7.18073 | 63.887 |
| 7.18845 | 63.801 |
| 7.19617 | 63.719 |
| 7.20389 | 63.639 |
| 7.211609999999999 | 63.56 |
| 7.21933 | 63.486 |
| 7.22705 | 63.415 |
| 7.23478 | 63.348 |
| 7.2425 | 63.286 |
| 7.2502200000000006 | 63.233 |
| 7.25794 | 63.193 |
| 7.26566 | 63.163 |
| 7.27338 | 63.143 |
| 7.2811 | 63.133 |
| 7.288819999999999 | 63.128 |
| 7.29654 | 63.126 |
| 7.304270000000001 | 63.13 |
| 7.31199 | 63.142 |
| 7.31971 | 63.164 |
| 7.3274300000000006 | 63.195 |
| 7.33515 | 63.233 |
| 7.34287 | 63.278 |
| 7.35059 | 63.324 |
| 7.35831 | 63.367 |
| 7.36604 | 63.409 |
| 7.37376 | 63.45 |
| 7.38148 | 63.488 |
| 7.3892 | 63.523 |
| 7.39692 | 63.549 |
| 7.4046400000000006 | 63.559 |
| 7.41236 | 63.556 |
| 7.42008 | 63.538 |
| 7.42781 | 63.504 |
| 7.43553 | 63.449 |
| 7.44325 | 63.381 |
| 7.45097 | 63.298 |
| 7.45869 | 63.187 |
| 7.46641 | 63.052 |
| 7.47413 | 62.896 |
| 7.4818500000000006 | 62.717 |
| 7.48958 | 62.516 |
| 7.4973 | 62.302 |
| 7.50502 | 62.078 |
| 7.51274 | 61.837 |
| 7.52046 | 61.585 |
| 7.52818 | 61.325 |
| 7.5359 | 61.056 |
| 7.54362 | 60.782 |
| 7.55134 | 60.507 |
| 7.559069999999999 | 60.233 |
| 7.56679 | 59.965 |
| 7.57451 | 59.701 |
| 7.582229999999999 | 59.441 |
| 7.58995 | 59.189 |
| 7.59767 | 58.947 |
| 7.605390000000001 | 58.713 |
| 7.61311 | 58.491 |
| 7.62084 | 58.287 |
| 7.62856 | 58.096 |
| 7.63628 | 57.922 |
| 7.644 | 57.772 |
| 7.65172 | 57.634 |
| 7.65944 | 57.509 |
| 7.66716 | 57.405 |
| 7.67488 | 57.314 |
| 7.6826099999999995 | 57.235 |
| 7.69033 | 57.181 |
| 7.69805 | 57.143 |
| 7.70577 | 57.12 |
| 7.71349 | 57.123 |
| 7.72121 | 57.142 |
| 7.72893 | 57.176 |
| 7.73665 | 57.23 |
| 7.7443800000000005 | 57.299 |
| 7.7521 | 57.38 |
| 7.7598199999999995 | 57.479 |
| 7.76754 | 57.591 |
| 7.77526 | 57.711 |
| 7.782979999999999 | 57.844 |
| 7.7907 | 57.984 |
| 7.79842 | 58.13 |
| 7.80614 | 58.284 |
| 7.81387 | 58.442 |
| 7.8215900000000005 | 58.603 |
| 7.82931 | 58.766 |
| 7.8370299999999995 | 58.928 |
| 7.84475 | 59.089 |
| 7.85247 | 59.244 |
| 7.860189999999999 | 59.396 |
| 7.86791 | 59.546 |
| 7.875640000000001 | 59.689 |
| 7.88336 | 59.83 |
| 7.89108 | 59.966 |
| 7.8988000000000005 | 60.098 |
| 7.90652 | 60.227 |
| 7.9142399999999995 | 60.351 |
| 7.92196 | 60.47 |
| 7.92968 | 60.585 |
| 7.93741 | 60.696 |
| 7.94513 | 60.805 |
| 7.952850000000001 | 60.912 |
| 7.96057 | 61.013 |
| 7.96829 | 61.111 |
| 7.9760100000000005 | 61.204 |
| 7.9837299999999995 | 61.29 |
| 7.9914499999999995 | 61.373 |
| 7.99918 | 61.449 |
| 8.0069 | 61.522 |
| 8.01462 | 61.591 |
| 8.02234 | 61.655 |
| 8.03006 | 61.716 |
| 8.03778 | 61.773 |
| 8.0455 | 61.824 |
| 8.05322 | 61.871 |
| 8.06094 | 61.914 |
| 8.068670000000001 | 61.954 |
| 8.07639 | 61.991 |
| 8.084109999999999 | 62.022 |
| 8.09183 | 62.049 |
| 8.09955 | 62.069 |
| 8.10727 | 62.081 |
| 8.11499 | 62.088 |
| 8.12271 | 62.084 |
| 8.13044 | 62.075 |
| 8.13816 | 62.059 |
| 8.14588 | 62.034 |
| 8.1536 | 62.003 |
| 8.16132 | 61.956 |
| 8.16904 | 61.901 |
| 8.17676 | 61.834 |
| 8.184479999999999 | 61.751 |
| 8.19221 | 61.662 |
| 8.19993 | 61.552 |
| 8.20765 | 61.435 |
| 8.21537 | 61.304 |
| 8.223090000000001 | 61.159 |
| 8.23081 | 61.006 |
| 8.23853 | 60.829 |
| 8.24625 | 60.646 |
| 8.25398 | 60.447 |
| 8.261700000000001 | 60.237 |
| 8.26942 | 60.02 |
| 8.27714 | 59.789 |
| 8.28486 | 59.553 |
| 8.29258 | 59.302 |
| 8.3003 | 59.043 |
| 8.30802 | 58.774 |
| 8.31574 | 58.493 |
| 8.323469999999999 | 58.208 |
| 8.331190000000001 | 57.912 |
| 8.33891 | 57.616 |
| 8.34663 | 57.316 |
| 8.35435 | 57.016 |
| 8.36207 | 56.715 |
| 8.36979 | 56.413 |
| 8.377510000000001 | 56.111 |
| 8.38524 | 55.809 |
| 8.392959999999999 | 55.51 |
| 8.40068 | 55.214 |
| 8.4084 | 54.921 |
| 8.416120000000001 | 54.632 |
| 8.42384 | 54.347 |
| 8.43156 | 54.064 |
| 8.43928 | 53.789 |
| 8.44701 | 53.516 |
| 8.45473 | 53.252 |
| 8.46245 | 52.992 |
| 8.47017 | 52.738 |
| 8.477889999999999 | 52.49 |
| 8.485610000000001 | 52.246 |
| 8.49333 | 52.011 |
| 8.50105 | 51.778 |
| 8.50878 | 51.551 |
| 8.5165 | 51.326 |
| 8.52422 | 51.105 |
| 8.53194 | 50.887 |
| 8.53966 | 50.672 |
| 8.547379999999999 | 50.459 |
| 8.5551 | 50.248 |
| 8.56282 | 50.036 |
| 8.570540000000001 | 49.826 |
| 8.57827 | 49.614 |
| 8.585989999999999 | 49.404 |
| 8.59371 | 49.195 |
| 8.60143 | 48.987 |
| 8.60915 | 48.781 |
| 8.61687 | 48.576 |
| 8.62459 | 48.373 |
| 8.63231 | 48.167 |
| 8.64004 | 47.961 |
| 8.64776 | 47.748 |
| 8.655479999999999 | 47.532 |
| 8.663200000000002 | 47.306 |
| 8.67092 | 47.077 |
| 8.67864 | 46.835 |
| 8.68636 | 46.592 |
| 8.69408 | 46.334 |
| 8.70181 | 46.074 |
| 8.70953 | 45.799 |
| 8.71725 | 45.52 |
| 8.724969999999999 | 45.228 |
| 8.73269 | 44.931 |
| 8.74041 | 44.624 |
| 8.74813 | 44.314 |
| 8.75585 | 44.003 |
| 8.76357 | 43.698 |
| 8.7713 | 43.398 |
| 8.779020000000001 | 43.113 |
| 8.78674 | 42.836 |
| 8.794459999999999 | 42.582 |
| 8.80218 | 42.337 |
| 8.809899999999999 | 42.122 |
| 8.817620000000002 | 41.914 |
| 8.82534 | 41.742 |
| 8.83307 | 41.576 |
| 8.84079 | 41.444 |
| 8.848510000000001 | 41.316 |
| 8.85623 | 41.214 |
| 8.86395 | 41.114 |
| 8.87167 | 41.033 |
| 8.879389999999999 | 40.952 |
| 8.88711 | 40.888 |
| 8.89484 | 40.824 |
| 8.90256 | 40.779 |
| 8.91028 | 40.735 |
| 8.918 | 40.709 |
| 8.92572 | 40.684 |
| 8.933440000000001 | 40.674 |
| 8.94116 | 40.665 |
| 8.948879999999999 | 40.67 |
| 8.956610000000001 | 40.678 |
| 8.96433 | 40.701 |
| 8.97205 | 40.726 |
| 8.97977 | 40.767 |
| 8.98749 | 40.809 |
| 8.995209999999998 | 40.867 |
| 9.002930000000001 | 40.925 |
| 9.01065 | 40.998 |
| 9.01837 | 41.071 |
| 9.0261 | 41.16 |
| 9.03382 | 41.249 |
| 9.041540000000001 | 41.352 |
| 9.04926 | 41.456 |
| 9.05698 | 41.573 |
| 9.0647 | 41.691 |
| 9.07242 | 41.82 |
| 9.08014 | 41.951 |
| 9.08787 | 42.091 |
| 9.09559 | 42.233 |
| 9.103309999999999 | 42.382 |
| 9.111030000000001 | 42.534 |
| 9.11875 | 42.693 |
| 9.12647 | 42.855 |
| 9.13419 | 43.023 |
| 9.14191 | 43.195 |
| 9.14964 | 43.372 |
| 9.15736 | 43.553 |
| 9.16508 | 43.736 |
| 9.172799999999999 | 43.922 |
| 9.18052 | 44.11 |
| 9.18824 | 44.301 |
| 9.19596 | 44.494 |
| 9.20368 | 44.693 |
| 9.211409999999999 | 44.893 |
| 9.21913 | 45.101 |
| 9.22685 | 45.309 |
| 9.23457 | 45.524 |
| 9.24229 | 45.737 |
| 9.25001 | 45.951 |
| 9.257729999999999 | 46.165 |
| 9.265450000000001 | 46.375 |
| 9.27317 | 46.585 |
| 9.280899999999999 | 46.792 |
| 9.288620000000002 | 46.998 |
| 9.29634 | 47.204 |
| 9.30406 | 47.41 |
| 9.31178 | 47.616 |
| 9.3195 | 47.82 |
| 9.327219999999999 | 48.022 |
| 9.334940000000001 | 48.219 |
| 9.34267 | 48.415 |
| 9.350389999999999 | 48.599 |
| 9.35811 | 48.782 |
| 9.36583 | 48.953 |
| 9.37355 | 49.12 |
| 9.38127 | 49.278 |
| 9.38899 | 49.429 |
| 9.396709999999999 | 49.572 |
| 9.404440000000001 | 49.702 |
| 9.41216 | 49.83 |
| 9.41988 | 49.939 |
| 9.4276 | 50.049 |
| 9.435319999999999 | 50.141 |
| 9.443040000000002 | 50.233 |
| 9.45076 | 50.313 |
| 9.45848 | 50.389 |
| 9.466209999999998 | 50.459 |
| 9.473930000000001 | 50.522 |
| 9.48165 | 50.582 |
| 9.489370000000001 | 50.634 |
| 9.49709 | 50.687 |
| 9.504809999999999 | 50.73 |
| 9.51253 | 50.772 |
| 9.52025 | 50.807 |
| 9.52797 | 50.838 |
| 9.5357 | 50.863 |
| 9.54342 | 50.882 |
| 9.55114 | 50.898 |
| 9.558860000000001 | 50.905 |
| 9.56658 | 50.912 |
| 9.5743 | 50.906 |
| 9.58202 | 50.9 |
| 9.589739999999999 | 50.883 |
| 9.59747 | 50.859 |
| 9.60519 | 50.828 |
| 9.61291 | 50.781 |
| 9.620629999999998 | 50.734 |
| 9.628350000000001 | 50.662 |
| 9.63607 | 50.59 |
| 9.643790000000001 | 50.501 |
| 9.65151 | 50.404 |
| 9.65924 | 50.298 |
| 9.66696 | 50.176 |
| 9.67468 | 50.054 |
| 9.6824 | 49.908 |
| 9.69012 | 49.763 |
| 9.69784 | 49.604 |
| 9.70556 | 49.44 |
| 9.713280000000001 | 49.271 |
| 9.72101 | 49.091 |
| 9.728729999999999 | 48.912 |
| 9.736450000000001 | 48.72 |
| 9.74417 | 48.528 |
| 9.75189 | 48.328 |
| 9.75961 | 48.124 |
| 9.76733 | 47.918 |
| 9.775049999999998 | 47.701 |
| 9.782770000000001 | 47.485 |
| 9.7905 | 47.258 |
| 9.798219999999999 | 47.03 |
| 9.80594 | 46.798 |
| 9.81366 | 46.562 |
| 9.82138 | 46.325 |
| 9.8291 | 46.081 |
| 9.83682 | 45.837 |
| 9.84454 | 45.588 |
| 9.85227 | 45.336 |
| 9.85999 | 45.082 |
| 9.867709999999999 | 44.823 |
| 9.87543 | 44.564 |
| 9.883149999999999 | 44.3 |
| 9.890870000000001 | 44.035 |
| 9.89859 | 43.769 |
| 9.90631 | 43.499 |
| 9.914040000000002 | 43.23 |
| 9.92176 | 42.959 |
| 9.92948 | 42.688 |
| 9.9372 | 42.416 |
| 9.94492 | 42.144 |
| 9.952639999999999 | 41.872 |
| 9.960360000000001 | 41.598 |
| 9.96808 | 41.324 |
| 9.97581 | 41.048 |
| 9.98353 | 40.77 |
| 9.99125 | 40.492 |
| 9.99897 | 40.209 |
| 10.0067 | 39.926 |
| 10.0144 | 39.64 |
| 10.0221 | 39.352 |
| 10.0299 | 39.064 |
| 10.037600000000001 | 38.768 |
| 10.0453 | 38.473 |
| 10.053 | 38.173 |
| 10.0607 | 37.867 |
| 10.0685 | 37.562 |
| 10.0762 | 37.245 |
| 10.0839 | 36.927 |
| 10.0916 | 36.606 |
| 10.0993 | 36.279 |
| 10.1071 | 35.952 |
| 10.114799999999999 | 35.623 |
| 10.1225 | 35.293 |
| 10.1302 | 34.966 |
| 10.138 | 34.644 |
| 10.145700000000001 | 34.322 |
| 10.1534 | 34.011 |
| 10.161100000000001 | 33.703 |
| 10.1688 | 33.399 |
| 10.1766 | 33.111 |
| 10.184299999999999 | 32.823 |
| 10.192 | 32.547 |
| 10.1997 | 32.281 |
| 10.2074 | 32.016 |
| 10.215200000000001 | 31.775 |
| 10.2229 | 31.534 |
| 10.2306 | 31.303 |
| 10.238299999999999 | 31.087 |
| 10.246 | 30.871 |
| 10.2538 | 30.674 |
| 10.2615 | 30.482 |
| 10.269200000000001 | 30.293 |
| 10.2769 | 30.125 |
| 10.2847 | 29.956 |
| 10.292399999999999 | 29.8 |
| 10.3001 | 29.654 |
| 10.307799999999999 | 29.509 |
| 10.3155 | 29.382 |
| 10.3233 | 29.259 |
| 10.331 | 29.14 |
| 10.338700000000001 | 29.037 |
| 10.3464 | 28.935 |
| 10.3541 | 28.843 |
| 10.3619 | 28.76 |
| 10.3696 | 28.678 |
| 10.3773 | 28.613 |
| 10.385 | 28.551 |
| 10.3928 | 28.493 |
| 10.4005 | 28.452 |
| 10.4082 | 28.412 |
| 10.415899999999999 | 28.379 |
| 10.4236 | 28.358 |
| 10.4314 | 28.337 |
| 10.4391 | 28.328 |
| 10.4468 | 28.323 |
| 10.4545 | 28.319 |
| 10.462200000000001 | 28.328 |
| 10.47 | 28.336 |
| 10.4777 | 28.348 |
| 10.4854 | 28.368 |
| 10.4931 | 28.388 |
| 10.5008 | 28.413 |
| 10.5086 | 28.443 |
| 10.5163 | 28.472 |
| 10.524 | 28.506 |
| 10.5317 | 28.54 |
| 10.5395 | 28.574 |
| 10.5472 | 28.605 |
| 10.5549 | 28.636 |
| 10.5626 | 28.663 |
| 10.5703 | 28.68 |
| 10.578100000000001 | 28.697 |
| 10.585799999999999 | 28.704 |
| 10.5935 | 28.697 |
| 10.6012 | 28.69 |
| 10.6089 | 28.663 |
| 10.616700000000002 | 28.624 |
| 10.6244 | 28.584 |
| 10.632100000000001 | 28.517 |
| 10.6398 | 28.443 |
| 10.6476 | 28.369 |
| 10.655299999999999 | 28.267 |
| 10.663 | 28.164 |
| 10.6707 | 28.058 |
| 10.6784 | 27.936 |
| 10.686200000000001 | 27.814 |
| 10.6939 | 27.688 |
| 10.701600000000001 | 27.552 |
| 10.709299999999999 | 27.417 |
| 10.717 | 27.278 |
| 10.7248 | 27.132 |
| 10.7325 | 26.987 |
| 10.740200000000002 | 26.839 |
| 10.7479 | 26.687 |
| 10.755600000000001 | 26.536 |
| 10.763399999999999 | 26.381 |
| 10.7711 | 26.224 |
| 10.778799999999999 | 26.068 |
| 10.7865 | 25.906 |
| 10.7943 | 25.742 |
| 10.802 | 25.579 |
| 10.809700000000001 | 25.409 |
| 10.8174 | 25.237 |
| 10.8251 | 25.066 |
| 10.8329 | 24.888 |
| 10.8406 | 24.709 |
| 10.8483 | 24.53 |
| 10.856 | 24.342 |
| 10.863700000000001 | 24.154 |
| 10.8715 | 23.966 |
| 10.8792 | 23.765 |
| 10.886899999999999 | 23.564 |
| 10.8946 | 23.361 |
| 10.9024 | 23.142 |
| 10.9101 | 22.924 |
| 10.9178 | 22.703 |
| 10.9255 | 22.465 |
| 10.933200000000001 | 22.227 |
| 10.941 | 21.989 |
| 10.9487 | 21.744 |
| 10.9564 | 21.5 |
| 10.9641 | 21.26 |
| 10.9718 | 21.035 |
| 10.9796 | 20.811 |
| 10.9873 | 20.592 |
| 10.995 | 20.406 |
| 11.0027 | 20.22 |
| 11.010399999999999 | 20.039 |
| 11.0182 | 19.89 |
| 11.0259 | 19.743 |
| 11.0336 | 19.597 |
| 11.0413 | 19.477 |
| 11.049100000000001 | 19.357 |
| 11.056799999999999 | 19.238 |
| 11.0645 | 19.138 |
| 11.0722 | 19.038 |
| 11.0799 | 18.938 |
| 11.0877 | 18.854 |
| 11.0954 | 18.771 |
| 11.1031 | 18.687 |
| 11.1108 | 18.617 |
| 11.1185 | 18.548 |
| 11.126299999999999 | 18.48 |
| 11.134 | 18.422 |
| 11.1417 | 18.366 |
| 11.1494 | 18.31 |
| 11.157200000000001 | 18.262 |
| 11.1649 | 18.217 |
| 11.172600000000001 | 18.173 |
| 11.180299999999999 | 18.135 |
| 11.188 | 18.101 |
| 11.195799999999998 | 18.068 |
| 11.2035 | 18.04 |
| 11.211200000000002 | 18.018 |
| 11.2189 | 17.997 |
| 11.226600000000001 | 17.978 |
| 11.234399999999999 | 17.966 |
| 11.2421 | 17.954 |
| 11.249799999999999 | 17.944 |
| 11.2575 | 17.94 |
| 11.2652 | 17.936 |
| 11.273 | 17.933 |
| 11.280700000000001 | 17.939 |
| 11.2884 | 17.944 |
| 11.296100000000001 | 17.95 |
| 11.3039 | 17.965 |
| 11.3116 | 17.981 |
| 11.3193 | 17.998 |
| 11.327 | 18.02 |
| 11.334700000000002 | 18.047 |
| 11.3425 | 18.073 |
| 11.350200000000001 | 18.103 |
| 11.357899999999999 | 18.136 |
| 11.3656 | 18.17 |
| 11.373299999999999 | 18.205 |
| 11.3811 | 18.244 |
| 11.3888 | 18.284 |
| 11.3965 | 18.323 |
| 11.404200000000001 | 18.368 |
| 11.412 | 18.413 |
| 11.4197 | 18.458 |
| 11.4274 | 18.508 |
| 11.4351 | 18.561 |
| 11.4428 | 18.613 |
| 11.4506 | 18.669 |
| 11.4583 | 18.73 |
| 11.466 | 18.79 |
| 11.473700000000001 | 18.852 |
| 11.481399999999999 | 18.92 |
| 11.4892 | 18.988 |
| 11.4969 | 19.056 |
| 11.5046 | 19.13 |
| 11.5123 | 19.205 |
| 11.52 | 19.28 |
| 11.5278 | 19.363 |
| 11.5355 | 19.454 |
| 11.5432 | 19.544 |
| 11.5509 | 19.642 |
| 11.5587 | 19.767 |
| 11.5664 | 19.891 |
| 11.5741 | 20.015 |
| 11.5818 | 20.181 |
| 11.5895 | 20.351 |
| 11.597299999999999 | 20.52 |
| 11.605 | 20.708 |
| 11.6127 | 20.91 |
| 11.6204 | 21.112 |
| 11.6281 | 21.314 |
| 11.6359 | 21.518 |
| 11.643600000000001 | 21.722 |
| 11.651299999999999 | 21.926 |
| 11.659 | 22.114 |
| 11.666799999999999 | 22.297 |
| 11.6745 | 22.48 |
| 11.6822 | 22.653 |
| 11.6899 | 22.81 |
| 11.6976 | 22.968 |
| 11.7054 | 23.125 |
| 11.7131 | 23.262 |
| 11.720799999999999 | 23.399 |
| 11.7285 | 23.535 |
| 11.7362 | 23.663 |
| 11.744 | 23.785 |
| 11.751700000000001 | 23.906 |
| 11.7594 | 24.026 |
| 11.767100000000001 | 24.136 |
| 11.774799999999999 | 24.246 |
| 11.7826 | 24.355 |
| 11.790299999999998 | 24.463 |
| 11.798 | 24.569 |
| 11.8057 | 24.675 |
| 11.8135 | 24.782 |
| 11.821200000000001 | 24.894 |
| 11.828899999999999 | 25.006 |
| 11.8366 | 25.118 |
| 11.844299999999999 | 25.232 |
| 11.8521 | 25.347 |
| 11.8598 | 25.462 |
| 11.8675 | 25.573 |
| 11.875200000000001 | 25.668 |
| 11.8829 | 25.764 |
| 11.8907 | 25.859 |
| 11.898399999999999 | 25.922 |
| 11.9061 | 25.969 |
| 11.913799999999998 | 26.016 |
| 11.9216 | 26.055 |
| 11.9293 | 26.034 |
| 11.937 | 26.014 |
| 11.944700000000001 | 25.993 |
| 11.952399999999999 | 25.928 |
| 11.9602 | 25.828 |
| 11.9679 | 25.728 |
| 11.9756 | 25.628 |
| 11.9833 | 25.445 |
| 11.991 | 25.262 |
| 11.9988 | 25.078 |
| 12.0065 | 24.866 |
| 12.0142 | 24.608 |
| 12.0219 | 24.351 |
| 12.0296 | 24.095 |
| 12.0374 | 23.803 |
| 12.0451 | 23.503 |
| 12.0528 | 23.204 |
| 12.0605 | 22.904 |
| 12.068299999999999 | 22.604 |
| 12.076 | 22.305 |
| 12.0837 | 22.006 |
| 12.0914 | 21.725 |
| 12.0991 | 21.461 |
| 12.1069 | 21.197 |
| 12.114600000000001 | 20.934 |
| 12.1223 | 20.714 |
| 12.13 | 20.501 |
| 12.1377 | 20.288 |
| 12.1455 | 20.086 |
| 12.1532 | 19.925 |
| 12.1609 | 19.765 |
| 12.1686 | 19.606 |
| 12.1764 | 19.474 |
| 12.1841 | 19.371 |
| 12.191799999999999 | 19.268 |
| 12.1995 | 19.166 |
| 12.2072 | 19.112 |
| 12.215 | 19.071 |
| 12.222700000000001 | 19.03 |
| 12.2304 | 18.994 |
| 12.238100000000001 | 19.013 |
| 12.2458 | 19.033 |
| 12.2536 | 19.053 |
| 12.261299999999999 | 19.089 |
| 12.269 | 19.157 |
| 12.2767 | 19.225 |
| 12.2844 | 19.293 |
| 12.292200000000001 | 19.378 |
| 12.2999 | 19.477 |
| 12.3076 | 19.575 |
| 12.315299999999999 | 19.673 |
| 12.3231 | 19.786 |
| 12.3308 | 19.904 |
| 12.3385 | 20.021 |
| 12.346200000000001 | 20.138 |
| 12.3539 | 20.279 |
| 12.3617 | 20.421 |
| 12.369399999999999 | 20.562 |
| 12.3771 | 20.709 |
| 12.384799999999998 | 20.884 |
| 12.3925 | 21.058 |
| 12.4003 | 21.233 |
| 12.408 | 21.414 |
| 12.415700000000001 | 21.608 |
| 12.423399999999999 | 21.802 |
| 12.4312 | 21.995 |
| 12.4389 | 22.172 |
| 12.4466 | 22.331 |
| 12.4543 | 22.49 |
| 12.462 | 22.648 |
| 12.4698 | 22.734 |
| 12.4775 | 22.774 |
| 12.4852 | 22.813 |
| 12.492899999999999 | 22.853 |
| 12.5006 | 22.776 |
| 12.5084 | 22.655 |
| 12.5161 | 22.533 |
| 12.5238 | 22.412 |
| 12.5315 | 22.21 |
| 12.539200000000001 | 21.989 |
| 12.547 | 21.769 |
| 12.5547 | 21.549 |
| 12.5624 | 21.336 |
| 12.5701 | 21.124 |
| 12.5779 | 20.912 |
| 12.585600000000001 | 20.701 |
| 12.5933 | 20.547 |
| 12.601 | 20.398 |
| 12.6087 | 20.25 |
| 12.6165 | 20.101 |
| 12.6242 | 20.008 |
| 12.6319 | 19.916 |
| 12.6396 | 19.824 |
| 12.6473 | 19.732 |
| 12.655100000000001 | 19.675 |
| 12.662799999999999 | 19.618 |
| 12.6705 | 19.561 |
| 12.6782 | 19.504 |
| 12.686 | 19.464 |
| 12.693700000000002 | 19.425 |
| 12.7014 | 19.385 |
| 12.709100000000001 | 19.345 |
| 12.7168 | 19.311 |
| 12.7246 | 19.276 |
| 12.732299999999999 | 19.242 |
| 12.74 | 19.208 |
| 12.7477 | 19.174 |
| 12.7554 | 19.14 |
| 12.763200000000001 | 19.106 |
| 12.7709 | 19.072 |
| 12.7786 | 19.037 |
| 12.786299999999999 | 19.002 |
| 12.794 | 18.967 |
| 12.8018 | 18.932 |
| 12.8095 | 18.895 |
| 12.817200000000001 | 18.857 |
| 12.8249 | 18.819 |
| 12.8327 | 18.781 |
| 12.840399999999999 | 18.741 |
| 12.8481 | 18.7 |
| 12.855799999999999 | 18.659 |
| 12.8635 | 18.618 |
| 12.8713 | 18.577 |
| 12.879 | 18.534 |
| 12.886700000000001 | 18.492 |
| 12.8944 | 18.45 |
| 12.9021 | 18.408 |
| 12.9099 | 18.365 |
| 12.9176 | 18.322 |
| 12.9253 | 18.28 |
| 12.933 | 18.237 |
| 12.9408 | 18.192 |
| 12.9485 | 18.148 |
| 12.9562 | 18.104 |
| 12.963899999999999 | 18.06 |
| 12.9716 | 18.015 |
| 12.9794 | 17.97 |
| 12.9871 | 17.926 |
| 12.9948 | 17.881 |
| 13.0025 | 17.836 |
| 13.010200000000001 | 17.79 |
| 13.018 | 17.744 |
| 13.0257 | 17.699 |
| 13.0334 | 17.651 |
| 13.0411 | 17.601 |
| 13.0488 | 17.552 |
| 13.0566 | 17.502 |
| 13.0643 | 17.451 |
| 13.072 | 17.397 |
| 13.0797 | 17.344 |
| 13.0875 | 17.29 |
| 13.0952 | 17.236 |
| 13.1029 | 17.182 |
| 13.1106 | 17.128 |
| 13.1183 | 17.074 |
| 13.126100000000001 | 17.019 |
| 13.133799999999999 | 16.964 |
| 13.1415 | 16.91 |
| 13.1492 | 16.854 |
| 13.1569 | 16.8 |
| 13.1647 | 16.742 |
| 13.1724 | 16.681 |
| 13.1801 | 16.619 |
| 13.1878 | 16.558 |
| 13.1956 | 16.496 |
| 13.203299999999999 | 16.425 |
| 13.211 | 16.355 |
| 13.2187 | 16.284 |
| 13.2264 | 16.214 |
| 13.234200000000001 | 16.138 |
| 13.2419 | 16.06 |
| 13.249600000000001 | 15.982 |
| 13.257299999999999 | 15.904 |
| 13.265 | 15.824 |
| 13.2728 | 15.739 |
| 13.2805 | 15.655 |
| 13.288200000000002 | 15.571 |
| 13.2959 | 15.487 |
| 13.303600000000001 | 15.392 |
| 13.311399999999999 | 15.297 |
| 13.3191 | 15.202 |
| 13.326799999999999 | 15.107 |
| 13.3345 | 15.003 |
| 13.3423 | 14.892 |
| 13.35 | 14.781 |
| 13.357700000000001 | 14.67 |
| 13.3654 | 14.557 |
| 13.3731 | 14.426 |
| 13.3809 | 14.294 |
| 13.3886 | 14.163 |
| 13.3963 | 14.032 |
| 13.404 | 13.887 |
| 13.411700000000002 | 13.734 |
| 13.4195 | 13.581 |
| 13.427200000000001 | 13.428 |
| 13.434899999999999 | 13.274 |
| 13.4426 | 13.113 |
| 13.4504 | 12.951 |
| 13.4581 | 12.79 |
| 13.4658 | 12.629 |
| 13.4735 | 12.486 |
| 13.481200000000001 | 12.355 |
| 13.489 | 12.224 |
| 13.4967 | 12.093 |
| 13.5044 | 11.968 |
| 13.5121 | 11.909 |
| 13.5198 | 11.851 |
| 13.5276 | 11.793 |
| 13.5353 | 11.735 |
| 13.543 | 11.72 |
| 13.5507 | 11.745 |
| 13.558399999999999 | 11.77 |
| 13.5662 | 11.795 |
| 13.5739 | 11.82 |
| 13.5816 | 11.902 |
| 13.5893 | 11.988 |
| 13.597100000000001 | 12.074 |
| 13.6048 | 12.16 |
| 13.6125 | 12.257 |
| 13.6202 | 12.377 |
| 13.6279 | 12.496 |
| 13.6357 | 12.616 |
| 13.6434 | 12.735 |
| 13.6511 | 12.866 |
| 13.6588 | 13.002 |
| 13.6665 | 13.139 |
| 13.674299999999999 | 13.275 |
| 13.682 | 13.411 |
| 13.6897 | 13.558 |
| 13.6974 | 13.706 |
| 13.705200000000001 | 13.853 |
| 13.7129 | 14 |
| 13.720600000000001 | 14.151 |
| 13.728299999999999 | 14.31 |
| 13.736 | 14.47 |
| 13.743799999999998 | 14.63 |
| 13.7515 | 14.789 |
| 13.7592 | 14.958 |
| 13.7669 | 15.133 |
| 13.7746 | 15.308 |
| 13.782399999999999 | 15.483 |
| 13.7901 | 15.658 |
| 13.797799999999999 | 15.849 |
| 13.8055 | 16.042 |
| 13.8132 | 16.235 |
| 13.821 | 16.428 |
| 13.828700000000001 | 16.623 |
| 13.8364 | 16.84 |
| 13.844100000000001 | 17.057 |
| 13.851899999999999 | 17.274 |
| 13.8596 | 17.49 |
| 13.867299999999998 | 17.718 |
| 13.875 | 17.972 |
| 13.882700000000002 | 18.225 |
| 13.8905 | 18.478 |
| 13.898200000000001 | 18.73 |
| 13.905899999999999 | 19.013 |
| 13.9136 | 19.325 |
| 13.921299999999999 | 19.637 |
| 13.9291 | 19.948 |
| 13.9368 | 20.259 |
| 13.9445 | 20.626 |
| 13.952200000000001 | 21.022 |
| 13.96 | 21.417 |
| 13.9677 | 21.812 |
| 13.9754 | 22.206 |
| 13.9831 | 22.661 |
| 13.9908 | 23.131 |
| 13.9986 | 23.601 |
| 14.0063 | 24.07 |
| 14.014 | 24.539 |
| 14.021700000000001 | 25.021 |
| 14.029399999999999 | 25.504 |
| 14.0372 | 25.987 |
| 14.0449 | 26.469 |
| 14.0526 | 26.95 |
| 14.0603 | 27.375 |
| 14.068 | 27.799 |
| 14.0758 | 28.222 |
| 14.0835 | 28.644 |
| 14.0912 | 29.063 |
| 14.0989 | 29.395 |
| 14.1067 | 29.726 |
| 14.1144 | 30.057 |
| 14.1221 | 30.388 |
| 14.1298 | 30.712 |
| 14.1375 | 30.956 |
| 14.145299999999999 | 31.2 |
| 14.153 | 31.443 |
| 14.1607 | 31.686 |
| 14.1684 | 31.924 |
| 14.1761 | 32.092 |
| 14.1839 | 32.261 |
| 14.191600000000001 | 32.429 |
| 14.1993 | 32.597 |
| 14.207 | 32.762 |
| 14.214799999999999 | 32.858 |
| 14.2225 | 32.955 |
| 14.2302 | 33.052 |
| 14.2379 | 33.148 |
| 14.2456 | 33.244 |
| 14.2534 | 33.263 |
| 14.2611 | 33.281 |
| 14.268799999999999 | 33.298 |
| 14.2765 | 33.316 |
| 14.2842 | 33.333 |
| 14.292 | 33.277 |
| 14.299700000000001 | 33.213 |
| 14.3074 | 33.15 |
| 14.315100000000001 | 33.086 |
| 14.322799999999999 | 33.022 |
| 14.3306 | 32.915 |
| 14.338299999999998 | 32.796 |
| 14.346 | 32.678 |
| 14.3537 | 32.56 |
| 14.3615 | 32.442 |
| 14.369200000000001 | 32.319 |
| 14.3769 | 32.195 |
| 14.3846 | 32.07 |
| 14.392299999999999 | 31.946 |
| 14.4001 | 31.822 |
| 14.4078 | 31.71 |
| 14.4155 | 31.612 |
| 14.423200000000001 | 31.514 |
| 14.4309 | 31.416 |
| 14.4387 | 31.318 |
| 14.446399999999999 | 31.228 |
| 14.4541 | 31.161 |
| 14.461799999999998 | 31.093 |
| 14.4696 | 31.026 |
| 14.4773 | 30.959 |
| 14.485 | 30.893 |
| 14.492700000000001 | 30.852 |
| 14.500399999999999 | 30.811 |
| 14.5082 | 30.77 |
| 14.5159 | 30.73 |
| 14.5236 | 30.689 |
| 14.5313 | 30.668 |
| 14.539 | 30.651 |
| 14.5468 | 30.634 |
| 14.5545 | 30.618 |
| 14.5622 | 30.601 |
| 14.5699 | 30.594 |
| 14.5776 | 30.595 |
| 14.5854 | 30.597 |
| 14.5931 | 30.598 |
| 14.6008 | 30.6 |
| 14.6085 | 30.602 |
| 14.616299999999999 | 30.609 |
| 14.624 | 30.616 |
| 14.6317 | 30.623 |
| 14.6394 | 30.629 |
| 14.6471 | 30.636 |
| 14.6549 | 30.638 |
| 14.662600000000001 | 30.638 |
| 14.6703 | 30.638 |
| 14.678 | 30.639 |
| 14.6857 | 30.639 |
| 14.6935 | 30.635 |
| 14.7012 | 30.625 |
| 14.7089 | 30.616 |
| 14.7166 | 30.606 |
| 14.7244 | 30.596 |
| 14.7321 | 30.586 |
| 14.739799999999999 | 30.566 |
| 14.7475 | 30.547 |
| 14.7552 | 30.528 |
| 14.763 | 30.509 |
| 14.770700000000001 | 30.49 |
| 14.7784 | 30.465 |
| 14.786100000000001 | 30.438 |
| 14.7938 | 30.411 |
| 14.8016 | 30.384 |
| 14.809299999999999 | 30.357 |
| 14.817 | 30.329 |
| 14.8247 | 30.299 |
| 14.8324 | 30.268 |
| 14.840200000000001 | 30.238 |
| 14.8479 | 30.208 |
| 14.8556 | 30.177 |
| 14.863299999999999 | 30.146 |
| 14.8711 | 30.114 |
| 14.8788 | 30.082 |
| 14.8865 | 30.05 |
| 14.894200000000001 | 30.018 |
| 14.9019 | 29.985 |
| 14.9097 | 29.94 |
| 14.917399999999999 | 29.896 |
| 14.9251 | 29.852 |
| 14.932799999999999 | 29.808 |
| 14.9405 | 29.764 |
| 14.9483 | 29.71 |
| 14.956 | 29.65 |
| 14.963700000000001 | 29.59 |
| 14.9714 | 29.53 |
| 14.9792 | 29.469 |
| 14.9869 | 29.409 |
| 14.9946 | 29.359 |
| 15.0023 | 29.308 |
| 15.01 | 29.258 |
| 15.0178 | 29.208 |
| 15.0255 | 29.158 |
| 15.0332 | 29.112 |
| 15.040899999999999 | 29.074 |
| 15.0486 | 29.037 |
| 15.0564 | 28.999 |
| 15.0641 | 28.962 |
| 15.0718 | 28.924 |
| 15.0795 | 28.886 |
| 15.087200000000001 | 28.848 |
| 15.095 | 28.809 |
| 15.1027 | 28.771 |
| 15.1104 | 28.733 |
| 15.1181 | 28.695 |
| 15.1259 | 28.652 |
| 15.1336 | 28.609 |
| 15.1413 | 28.566 |
| 15.149 | 28.524 |
| 15.1567 | 28.481 |
| 15.1645 | 28.438 |
| 15.1722 | 28.392 |
| 15.1799 | 28.347 |
| 15.1876 | 28.302 |
| 15.1953 | 28.257 |
| 15.203100000000001 | 28.212 |
| 15.210799999999999 | 28.167 |
| 15.2185 | 28.121 |
| 15.2262 | 28.076 |
| 15.234 | 28.03 |
| 15.241700000000002 | 27.984 |
| 15.2494 | 27.939 |
| 15.257100000000001 | 27.894 |
| 15.2648 | 27.85 |
| 15.2726 | 27.806 |
| 15.280299999999999 | 27.762 |
| 15.288 | 27.718 |
| 15.2957 | 27.673 |
| 15.3034 | 27.632 |
| 15.311200000000001 | 27.591 |
| 15.3189 | 27.55 |
| 15.326600000000001 | 27.509 |
| 15.334299999999999 | 27.468 |
| 15.342 | 27.427 |
| 15.3498 | 27.385 |
| 15.3575 | 27.343 |
| 15.365200000000002 | 27.302 |
| 15.3729 | 27.26 |
| 15.380700000000001 | 27.218 |
| 15.388399999999999 | 27.175 |
| 15.3961 | 27.124 |
| 15.403799999999999 | 27.072 |
| 15.4115 | 27.021 |
| 15.4193 | 26.97 |
| 15.427 | 26.919 |
| 15.434700000000001 | 26.864 |
| 15.4424 | 26.798 |
| 15.4501 | 26.733 |
| 15.4579 | 26.667 |
| 15.4656 | 26.601 |
| 15.4733 | 26.536 |
| 15.481 | 26.467 |
| 15.4888 | 26.388 |
| 15.4965 | 26.309 |
| 15.5042 | 26.23 |
| 15.511899999999999 | 26.152 |
| 15.5196 | 26.073 |
| 15.5274 | 25.992 |
| 15.5351 | 25.905 |
| 15.5428 | 25.818 |
| 15.5505 | 25.731 |
| 15.558200000000001 | 25.644 |
| 15.566 | 25.557 |
| 15.5737 | 25.47 |
| 15.5814 | 25.383 |
| 15.5891 | 25.296 |
| 15.5968 | 25.21 |
| 15.6046 | 25.123 |
| 15.6123 | 25.036 |
| 15.62 | 24.95 |
| 15.6277 | 24.867 |
| 15.6355 | 24.784 |
| 15.6432 | 24.7 |
| 15.6509 | 24.617 |
| 15.6586 | 24.534 |
| 15.6663 | 24.451 |
| 15.674100000000001 | 24.352 |
| 15.681799999999999 | 24.253 |
| 15.6895 | 24.155 |
| 15.6972 | 24.056 |
| 15.7049 | 23.958 |
| 15.7127 | 23.86 |
| 15.7204 | 23.695 |
| 15.7281 | 23.522 |
| 15.7358 | 23.349 |
| 15.7436 | 23.176 |
| 15.751299999999999 | 23.004 |
| 15.759 | 22.831 |
| 15.7667 | 22.533 |
| 15.7744 | 22.181 |
| 15.782200000000001 | 21.83 |
| 15.7899 | 21.479 |
| 15.797600000000001 | 21.128 |
| 15.805299999999999 | 20.778 |
| 15.813 | 20.304 |
| 15.820799999999998 | 19.695 |
| 15.8285 | 19.087 |
| 15.836200000000002 | 18.48 |
| 15.8439 | 17.873 |
| 15.851600000000001 | 17.266 |
| 15.859399999999999 | 16.62 |
| 15.8671 | 15.825 |
| 15.874799999999999 | 15.032 |
| 15.8825 | 14.239 |
| 15.8903 | 13.447 |
| 15.898 | 12.656 |
| 15.905700000000001 | 11.865 |
| 15.9134 | 11.102 |
| 15.921100000000001 | 10.342 |
| 15.9289 | 9.582 |
| 15.9366 | 8.823 |
| 15.9443 | 8.065 |
| 15.952 | 7.308 |
| 15.959700000000002 | 6.679 |
| 15.9675 | 6.143 |
| 15.975200000000001 | 5.608 |
| 15.982899999999999 | 5.073 |
| 15.9906 | 4.539 |
| 15.9984 | 4.006 |
| 16.0061 | 3.523 |
| 16.0138 | 3.241 |
| 16.0215 | 2.959 |
| 16.0292 | 2.677 |
| 16.037 | 2.396 |
| 16.044700000000002 | 2.115 |
| 16.0524 | 1.834 |
| 16.060100000000002 | 1.684 |
| 16.0678 | 1.571 |
| 16.0756 | 1.457 |
| 16.083299999999998 | 1.343 |
| 16.091 | 1.23 |
| 16.0987 | 1.117 |
| 16.1064 | 1.029 |
| 16.1142 | 0.994 |
| 16.1219 | 0.959 |
| 16.1296 | 0.924 |
| 16.1373 | 0.889 |
| 16.1451 | 0.854 |
| 16.1528 | 0.819 |
| 16.1605 | 0.806 |
| 16.168200000000002 | 0.797 |
| 16.1759 | 0.789 |
| 16.1837 | 0.781 |
| 16.191399999999998 | 0.772 |
| 16.1991 | 0.764 |
| 16.206799999999998 | 0.756 |
| 16.2145 | 0.75 |
| 16.2223 | 0.744 |
| 16.23 | 0.738 |
| 16.2377 | 0.732 |
| 16.2454 | 0.726 |
| 16.2532 | 0.72 |
| 16.2609 | 0.711 |
| 16.2686 | 0.701 |
| 16.2763 | 0.69 |
| 16.284 | 0.68 |
| 16.2918 | 0.669 |
| 16.2995 | 0.658 |
| 16.3072 | 0.648 |
| 16.314899999999998 | 0.639 |
| 16.3226 | 0.629 |
| 16.3304 | 0.62 |
| 16.3381 | 0.611 |
| 16.3458 | 0.601 |
| 16.3535 | 0.592 |
| 16.3612 | 0.588 |
| 16.369 | 0.591 |
| 16.3767 | 0.594 |
| 16.384400000000003 | 0.598 |
| 16.3921 | 0.601 |
| 16.399900000000002 | 0.604 |
| 16.4076 | 0.608 |
| 16.4153 | 0.623 |
| 16.423 | 0.644 |
| 16.4307 | 0.665 |
| 16.4385 | 0.686 |
| 16.4462 | 0.707 |
| 16.4539 | 0.727 |
| 16.461599999999997 | 0.748 |
| 16.4693 | 0.782 |
| 16.4771 | 0.817 |
| 16.4848 | 0.852 |
| 16.4925 | 0.887 |
| 16.5002 | 0.921 |
| 16.508 | 0.956 |
| 16.515700000000002 | 0.994 |
| 16.523400000000002 | 1.044 |
| 16.5311 | 1.095 |
| 16.5388 | 1.146 |
| 16.546599999999998 | 1.197 |
| 16.554299999999998 | 1.247 |
| 16.562 | 1.298 |
| 16.5697 | 1.359 |
| 16.5774 | 1.44 |
| 16.5852 | 1.521 |
| 16.5929 | 1.602 |
| 16.6006 | 1.683 |
| 16.6083 | 1.764 |
| 16.616 | 1.844 |
| 16.6238 | 1.944 |
| 16.6315 | 2.065 |
| 16.639200000000002 | 2.186 |
| 16.646900000000002 | 2.307 |
| 16.654700000000002 | 2.427 |
| 16.6624 | 2.548 |
| 16.670099999999998 | 2.668 |
| 16.677799999999998 | 2.806 |
| 16.6855 | 2.958 |
| 16.6933 | 3.109 |
| 16.701 | 3.261 |
| 16.7087 | 3.412 |
| 16.7164 | 3.563 |
| 16.7241 | 3.714 |
| 16.731900000000003 | 3.873 |
| 16.7396 | 4.038 |
| 16.7473 | 4.203 |
| 16.755 | 4.367 |
| 16.7628 | 4.531 |
| 16.7705 | 4.695 |
| 16.778200000000002 | 4.859 |
| 16.7859 | 5.025 |
| 16.793599999999998 | 5.193 |
| 16.8014 | 5.36 |
| 16.809099999999997 | 5.528 |
| 16.8168 | 5.695 |
| 16.8245 | 5.862 |
| 16.8322 | 6.028 |
| 16.84 | 6.194 |
| 16.8477 | 6.36 |
| 16.855400000000003 | 6.525 |
| 16.8631 | 6.69 |
| 16.8708 | 6.854 |
| 16.8786 | 7.019 |
| 16.8863 | 7.183 |
| 16.894 | 7.343 |
| 16.9017 | 7.496 |
| 16.9095 | 7.65 |
| 16.9172 | 7.803 |
| 16.9249 | 7.956 |
| 16.932599999999997 | 8.109 |
| 16.9403 | 8.261 |
| 16.9481 | 8.408 |
| 16.9558 | 8.541 |
| 16.9635 | 8.673 |
| 16.9712 | 8.805 |
| 16.978900000000003 | 8.937 |
| 16.9867 | 9.069 |
| 16.994400000000002 | 9.201 |
| 17.0021 | 9.331 |
| 17.0098 | 9.442 |
| 17.017599999999998 | 9.552 |
| 17.025299999999998 | 9.662 |
| 17.033 | 9.773 |
| 17.0407 | 9.883 |
| 17.0484 | 9.993 |
| 17.0562 | 10.103 |
| 17.0639 | 10.196 |
| 17.0716 | 10.287 |
| 17.0793 | 10.377 |
| 17.087 | 10.468 |
| 17.0948 | 10.558 |
| 17.1025 | 10.648 |
| 17.1102 | 10.738 |
| 17.117900000000002 | 10.817 |
| 17.1256 | 10.886 |
| 17.1334 | 10.955 |
| 17.141099999999998 | 11.024 |
| 17.148799999999998 | 11.093 |
| 17.1565 | 11.162 |
| 17.1643 | 11.231 |
| 17.172 | 11.296 |
| 17.1797 | 11.344 |
| 17.1874 | 11.391 |
| 17.1951 | 11.439 |
| 17.202900000000003 | 11.486 |
| 17.2106 | 11.534 |
| 17.2183 | 11.581 |
| 17.226 | 11.628 |
| 17.233700000000002 | 11.66 |
| 17.2415 | 11.688 |
| 17.249200000000002 | 11.715 |
| 17.2569 | 11.743 |
| 17.264599999999998 | 11.771 |
| 17.2724 | 11.799 |
| 17.280099999999997 | 11.826 |
| 17.2878 | 11.847 |
| 17.2955 | 11.855 |
| 17.3032 | 11.862 |
| 17.311 | 11.87 |
| 17.3187 | 11.878 |
| 17.326400000000003 | 11.886 |
| 17.3341 | 11.894 |
| 17.3418 | 11.902 |
| 17.3496 | 11.888 |
| 17.3573 | 11.872 |
| 17.365 | 11.855 |
| 17.372700000000002 | 11.838 |
| 17.3804 | 11.822 |
| 17.3882 | 11.805 |
| 17.3959 | 11.788 |
| 17.403599999999997 | 11.761 |
| 17.4113 | 11.715 |
| 17.4191 | 11.668 |
| 17.4268 | 11.622 |
| 17.4345 | 11.576 |
| 17.4422 | 11.53 |
| 17.449900000000003 | 11.483 |
| 17.4577 | 11.437 |
| 17.465400000000002 | 11.372 |
| 17.4731 | 11.302 |
| 17.4808 | 11.232 |
| 17.4885 | 11.161 |
| 17.496299999999998 | 11.091 |
| 17.504 | 11.021 |
| 17.5117 | 10.95 |
| 17.5194 | 10.88 |
| 17.527099999999997 | 10.81 |
| 17.5349 | 10.74 |
| 17.5426 | 10.67 |
| 17.5503 | 10.6 |
| 17.558 | 10.53 |
| 17.5658 | 10.46 |
| 17.5735 | 10.39 |
| 17.5812 | 10.333 |
| 17.588900000000002 | 10.292 |
| 17.5966 | 10.252 |
| 17.604400000000002 | 10.211 |
| 17.612099999999998 | 10.171 |
| 17.619799999999998 | 10.131 |
| 17.6275 | 10.09 |
| 17.6352 | 10.05 |
| 17.643 | 10.035 |
| 17.6507 | 10.032 |
| 17.6584 | 10.028 |
| 17.6661 | 10.025 |
| 17.6739 | 10.022 |
| 17.6816 | 10.018 |
| 17.6893 | 10.015 |
| 17.697 | 10.011 |
| 17.7047 | 10.027 |
| 17.7125 | 10.046 |
| 17.720200000000002 | 10.064 |
| 17.7279 | 10.083 |
| 17.735599999999998 | 10.101 |
| 17.743299999999998 | 10.119 |
| 17.751099999999997 | 10.138 |
| 17.7588 | 10.156 |
| 17.7665 | 10.184 |
| 17.7742 | 10.211 |
| 17.7819 | 10.239 |
| 17.7897 | 10.266 |
| 17.797400000000003 | 10.294 |
| 17.8051 | 10.321 |
| 17.8128 | 10.349 |
| 17.8206 | 10.377 |
| 17.8283 | 10.41 |
| 17.836 | 10.443 |
| 17.843700000000002 | 10.476 |
| 17.8514 | 10.509 |
| 17.8592 | 10.542 |
| 17.8669 | 10.575 |
| 17.874599999999997 | 10.608 |
| 17.8823 | 10.641 |
| 17.89 | 10.675 |
| 17.8978 | 10.709 |
| 17.9055 | 10.743 |
| 17.9132 | 10.777 |
| 17.920900000000003 | 10.811 |
| 17.9287 | 10.845 |
| 17.936400000000003 | 10.879 |
| 17.9441 | 10.912 |
| 17.9518 | 10.943 |
| 17.9595 | 10.974 |
| 17.967299999999998 | 11.005 |
| 17.975 | 11.035 |
| 17.9827 | 11.066 |
| 17.9904 | 11.097 |
| 17.998099999999997 | 11.127 |
| 18.0059 | 11.158 |
| 18.0136 | 11.187 |
| 18.0213 | 11.216 |
| 18.029 | 11.244 |
| 18.0367 | 11.273 |
| 18.0445 | 11.302 |
| 18.0522 | 11.331 |
| 18.059900000000003 | 11.36 |
| 18.0676 | 11.388 |
| 18.075400000000002 | 11.418 |
| 18.083099999999998 | 11.448 |
| 18.090799999999998 | 11.477 |
| 18.0985 | 11.506 |
| 18.1062 | 11.536 |
| 18.114 | 11.565 |
| 18.1217 | 11.595 |
| 18.1294 | 11.624 |
| 18.1371 | 11.654 |
| 18.1448 | 11.684 |
| 18.1526 | 11.714 |
| 18.1603 | 11.744 |
| 18.168 | 11.774 |
| 18.1757 | 11.804 |
| 18.1835 | 11.834 |
| 18.191200000000002 | 11.864 |
| 18.198900000000002 | 11.894 |
| 18.206599999999998 | 11.925 |
| 18.214299999999998 | 11.956 |
| 18.222099999999998 | 11.986 |
| 18.2298 | 12.017 |
| 18.2375 | 12.048 |
| 18.2452 | 12.078 |
| 18.2529 | 12.109 |
| 18.2607 | 12.14 |
| 18.2684 | 12.172 |
| 18.2761 | 12.204 |
| 18.2838 | 12.235 |
| 18.2915 | 12.267 |
| 18.2993 | 12.299 |
| 18.307 | 12.331 |
| 18.314700000000002 | 12.363 |
| 18.322400000000002 | 12.394 |
| 18.3302 | 12.427 |
| 18.3379 | 12.46 |
| 18.345599999999997 | 12.493 |
| 18.3533 | 12.526 |
| 18.361 | 12.558 |
| 18.3688 | 12.591 |
| 18.3765 | 12.624 |
| 18.3842 | 12.656 |
| 18.3919 | 12.689 |
| 18.3996 | 12.723 |
| 18.407400000000003 | 12.756 |
| 18.4151 | 12.79 |
| 18.4228 | 12.823 |
| 18.4305 | 12.856 |
| 18.438299999999998 | 12.89 |
| 18.446 | 12.923 |
| 18.4537 | 12.956 |
| 18.4614 | 12.989 |
| 18.469099999999997 | 13.022 |
| 18.4769 | 13.056 |
| 18.484599999999997 | 13.089 |
| 18.4923 | 13.122 |
| 18.5 | 13.155 |
| 18.5077 | 13.188 |
| 18.5155 | 13.221 |
| 18.5232 | 13.253 |
| 18.530900000000003 | 13.283 |
| 18.5386 | 13.314 |
| 18.5463 | 13.344 |
| 18.5541 | 13.375 |
| 18.561799999999998 | 13.405 |
| 18.5695 | 13.435 |
| 18.5772 | 13.466 |
| 18.585 | 13.496 |
| 18.5927 | 13.522 |
| 18.6004 | 13.547 |
| 18.6081 | 13.572 |
| 18.6158 | 13.598 |
| 18.6236 | 13.623 |
| 18.6313 | 13.648 |
| 18.639 | 13.673 |
| 18.6467 | 13.698 |
| 18.654400000000003 | 13.722 |
| 18.662200000000002 | 13.743 |
| 18.669900000000002 | 13.763 |
| 18.677599999999998 | 13.784 |
| 18.685299999999998 | 13.804 |
| 18.693099999999998 | 13.825 |
| 18.7008 | 13.845 |
| 18.7085 | 13.866 |
| 18.7162 | 13.886 |
| 18.7239 | 13.905 |
| 18.7317 | 13.923 |
| 18.7394 | 13.94 |
| 18.7471 | 13.958 |
| 18.7548 | 13.975 |
| 18.7625 | 13.992 |
| 18.7703 | 14.01 |
| 18.778 | 14.027 |
| 18.785700000000002 | 14.045 |
| 18.793400000000002 | 14.058 |
| 18.801099999999998 | 14.071 |
| 18.8089 | 14.084 |
| 18.816599999999998 | 14.096 |
| 18.8243 | 14.108 |
| 18.832 | 14.121 |
| 18.8398 | 14.133 |
| 18.8475 | 14.146 |
| 18.8552 | 14.158 |
| 18.8629 | 14.165 |
| 18.8706 | 14.171 |
| 18.878400000000003 | 14.177 |
| 18.8861 | 14.184 |
| 18.8938 | 14.19 |
| 18.9015 | 14.196 |
| 18.909200000000002 | 14.202 |
| 18.917 | 14.208 |
| 18.9247 | 14.214 |
| 18.9324 | 14.218 |
| 18.940099999999997 | 14.223 |
| 18.9479 | 14.227 |
| 18.955599999999997 | 14.231 |
| 18.9633 | 14.235 |
| 18.971 | 14.239 |
| 18.9787 | 14.244 |
| 18.9865 | 14.248 |
| 18.9942 | 14.252 |
| 19.001900000000003 | 14.258 |
| 19.0096 | 14.264 |
| 19.0173 | 14.27 |
| 19.0251 | 14.276 |
| 19.032799999999998 | 14.283 |
| 19.0405 | 14.289 |
| 19.0482 | 14.295 |
| 19.0559 | 14.301 |
| 19.0637 | 14.307 |
| 19.0714 | 14.315 |
| 19.079099999999997 | 14.323 |
| 19.0868 | 14.33 |
| 19.0946 | 14.338 |
| 19.1023 | 14.345 |
| 19.11 | 14.353 |
| 19.1177 | 14.361 |
| 19.125400000000003 | 14.368 |
| 19.133200000000002 | 14.376 |
| 19.140900000000002 | 14.384 |
| 19.1486 | 14.392 |
| 19.156299999999998 | 14.401 |
| 19.164 | 14.409 |
| 19.171799999999998 | 14.418 |
| 19.1795 | 14.426 |
| 19.1872 | 14.434 |
| 19.1949 | 14.443 |
| 19.2027 | 14.451 |
| 19.2104 | 14.461 |
| 19.2181 | 14.471 |
| 19.2258 | 14.481 |
| 19.2335 | 14.492 |
| 19.2413 | 14.502 |
| 19.249 | 14.512 |
| 19.256700000000002 | 14.523 |
| 19.264400000000002 | 14.533 |
| 19.2721 | 14.543 |
| 19.2799 | 14.555 |
| 19.287599999999998 | 14.568 |
| 19.2953 | 14.582 |
| 19.303 | 14.595 |
| 19.3107 | 14.609 |
| 19.3185 | 14.622 |
| 19.3262 | 14.636 |
| 19.3339 | 14.649 |
| 19.3416 | 14.662 |
| 19.349400000000003 | 14.676 |
| 19.3571 | 14.691 |
| 19.3648 | 14.706 |
| 19.3725 | 14.721 |
| 19.380200000000002 | 14.736 |
| 19.388 | 14.751 |
| 19.3957 | 14.766 |
| 19.4034 | 14.781 |
| 19.411099999999998 | 14.796 |
| 19.4188 | 14.811 |
| 19.426599999999997 | 14.826 |
| 19.4343 | 14.84 |
| 19.442 | 14.854 |
| 19.4497 | 14.868 |
| 19.4575 | 14.882 |
| 19.4652 | 14.896 |
| 19.472900000000003 | 14.91 |
| 19.4806 | 14.924 |
| 19.4883 | 14.938 |
| 19.4961 | 14.951 |
| 19.5038 | 14.963 |
| 19.5115 | 14.975 |
| 19.5192 | 14.987 |
| 19.5269 | 14.999 |
| 19.5347 | 15.01 |
| 19.5424 | 15.022 |
| 19.550099999999997 | 15.034 |
| 19.5578 | 15.046 |
| 19.5655 | 15.058 |
| 19.5733 | 15.068 |
| 19.581 | 15.077 |
| 19.5887 | 15.087 |
| 19.596400000000003 | 15.096 |
| 19.604200000000002 | 15.106 |
| 19.611900000000002 | 15.115 |
| 19.6196 | 15.125 |
| 19.627299999999998 | 15.134 |
| 19.635 | 15.143 |
| 19.642799999999998 | 15.153 |
| 19.6505 | 15.161 |
| 19.6582 | 15.169 |
| 19.6659 | 15.177 |
| 19.673599999999997 | 15.185 |
| 19.6814 | 15.193 |
| 19.6891 | 15.201 |
| 19.6968 | 15.209 |
| 19.7045 | 15.217 |
| 19.7123 | 15.225 |
| 19.72 | 15.234 |
| 19.727700000000002 | 15.244 |
| 19.735400000000002 | 15.254 |
| 19.7431 | 15.263 |
| 19.7509 | 15.273 |
| 19.758599999999998 | 15.283 |
| 19.766299999999998 | 15.293 |
| 19.774 | 15.303 |
| 19.7817 | 15.313 |
| 19.7895 | 15.322 |
| 19.7972 | 15.334 |
| 19.8049 | 15.347 |
| 19.8126 | 15.359 |
| 19.8203 | 15.372 |
| 19.8281 | 15.384 |
| 19.8358 | 15.397 |
| 19.8435 | 15.409 |
| 19.851200000000002 | 15.422 |
| 19.859 | 15.434 |
| 19.8667 | 15.447 |
| 19.8744 | 15.46 |
| 19.882099999999998 | 15.473 |
| 19.8898 | 15.486 |
| 19.897599999999997 | 15.498 |
| 19.9053 | 15.511 |
| 19.913 | 15.524 |
| 19.9207 | 15.537 |
| 19.9284 | 15.55 |
| 19.9362 | 15.563 |
| 19.943900000000003 | 15.576 |
| 19.9516 | 15.587 |
| 19.9593 | 15.598 |
| 19.9671 | 15.61 |
| 19.9748 | 15.621 |
| 19.9825 | 15.632 |
| 19.9902 | 15.644 |
| 19.9979 | 15.655 |
| 20.0057 | 15.666 |